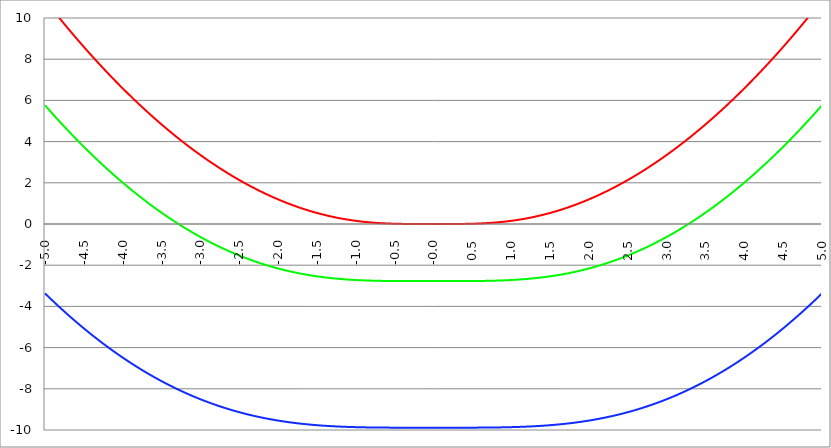
| Category | Series 1 | Series 0 | Series 2 |
|---|---|---|---|
| -5.0 | 10.871 | 5.765 | -3.369 |
| -4.995 | 10.847 | 5.744 | -3.387 |
| -4.99 | 10.823 | 5.722 | -3.405 |
| -4.985 | 10.799 | 5.701 | -3.424 |
| -4.98 | 10.775 | 5.679 | -3.442 |
| -4.975 | 10.751 | 5.658 | -3.46 |
| -4.97 | 10.727 | 5.637 | -3.478 |
| -4.965000000000001 | 10.703 | 5.615 | -3.497 |
| -4.960000000000001 | 10.679 | 5.594 | -3.515 |
| -4.955000000000001 | 10.656 | 5.573 | -3.533 |
| -4.950000000000001 | 10.632 | 5.551 | -3.551 |
| -4.945000000000001 | 10.608 | 5.53 | -3.569 |
| -4.940000000000001 | 10.584 | 5.509 | -3.587 |
| -4.935000000000001 | 10.561 | 5.488 | -3.605 |
| -4.930000000000001 | 10.537 | 5.466 | -3.623 |
| -4.925000000000002 | 10.513 | 5.445 | -3.641 |
| -4.920000000000002 | 10.49 | 5.424 | -3.659 |
| -4.915000000000002 | 10.466 | 5.403 | -3.677 |
| -4.910000000000002 | 10.442 | 5.382 | -3.695 |
| -4.905000000000002 | 10.419 | 5.361 | -3.713 |
| -4.900000000000002 | 10.395 | 5.34 | -3.731 |
| -4.895000000000002 | 10.372 | 5.319 | -3.748 |
| -4.890000000000002 | 10.348 | 5.298 | -3.766 |
| -4.885000000000002 | 10.325 | 5.277 | -3.784 |
| -4.880000000000002 | 10.301 | 5.256 | -3.802 |
| -4.875000000000003 | 10.278 | 5.235 | -3.819 |
| -4.870000000000003 | 10.255 | 5.214 | -3.837 |
| -4.865000000000003 | 10.231 | 5.194 | -3.855 |
| -4.860000000000003 | 10.208 | 5.173 | -3.872 |
| -4.855000000000003 | 10.185 | 5.152 | -3.89 |
| -4.850000000000003 | 10.161 | 5.131 | -3.907 |
| -4.845000000000003 | 10.138 | 5.111 | -3.925 |
| -4.840000000000003 | 10.115 | 5.09 | -3.942 |
| -4.835000000000003 | 10.092 | 5.069 | -3.96 |
| -4.830000000000004 | 10.069 | 5.049 | -3.977 |
| -4.825000000000004 | 10.045 | 5.028 | -3.995 |
| -4.820000000000004 | 10.022 | 5.007 | -4.012 |
| -4.815000000000004 | 9.999 | 4.987 | -4.03 |
| -4.810000000000004 | 9.976 | 4.966 | -4.047 |
| -4.805000000000004 | 9.953 | 4.946 | -4.064 |
| -4.800000000000004 | 9.93 | 4.925 | -4.081 |
| -4.795000000000004 | 9.907 | 4.905 | -4.099 |
| -4.790000000000004 | 9.884 | 4.885 | -4.116 |
| -4.785000000000004 | 9.861 | 4.864 | -4.133 |
| -4.780000000000004 | 9.838 | 4.844 | -4.15 |
| -4.775000000000004 | 9.815 | 4.823 | -4.167 |
| -4.770000000000004 | 9.793 | 4.803 | -4.184 |
| -4.765000000000005 | 9.77 | 4.783 | -4.202 |
| -4.760000000000005 | 9.747 | 4.763 | -4.219 |
| -4.755000000000005 | 9.724 | 4.742 | -4.236 |
| -4.750000000000005 | 9.701 | 4.722 | -4.253 |
| -4.745000000000005 | 9.679 | 4.702 | -4.27 |
| -4.740000000000005 | 9.656 | 4.682 | -4.287 |
| -4.735000000000005 | 9.633 | 4.662 | -4.303 |
| -4.730000000000005 | 9.611 | 4.642 | -4.32 |
| -4.725000000000006 | 9.588 | 4.622 | -4.337 |
| -4.720000000000006 | 9.565 | 4.602 | -4.354 |
| -4.715000000000006 | 9.543 | 4.582 | -4.371 |
| -4.710000000000006 | 9.52 | 4.562 | -4.388 |
| -4.705000000000006 | 9.498 | 4.542 | -4.404 |
| -4.700000000000006 | 9.475 | 4.522 | -4.421 |
| -4.695000000000006 | 9.453 | 4.502 | -4.438 |
| -4.690000000000006 | 9.43 | 4.482 | -4.454 |
| -4.685000000000007 | 9.408 | 4.462 | -4.471 |
| -4.680000000000007 | 9.386 | 4.443 | -4.488 |
| -4.675000000000007 | 9.363 | 4.423 | -4.504 |
| -4.670000000000007 | 9.341 | 4.403 | -4.521 |
| -4.665000000000007 | 9.319 | 4.383 | -4.537 |
| -4.660000000000007 | 9.296 | 4.364 | -4.554 |
| -4.655000000000007 | 9.274 | 4.344 | -4.57 |
| -4.650000000000007 | 9.252 | 4.324 | -4.587 |
| -4.645000000000007 | 9.23 | 4.305 | -4.603 |
| -4.640000000000008 | 9.207 | 4.285 | -4.619 |
| -4.635000000000008 | 9.185 | 4.266 | -4.636 |
| -4.630000000000008 | 9.163 | 4.246 | -4.652 |
| -4.625000000000008 | 9.141 | 4.227 | -4.668 |
| -4.620000000000008 | 9.119 | 4.207 | -4.685 |
| -4.615000000000008 | 9.097 | 4.188 | -4.701 |
| -4.610000000000008 | 9.075 | 4.168 | -4.717 |
| -4.605000000000008 | 9.053 | 4.149 | -4.733 |
| -4.600000000000008 | 9.031 | 4.129 | -4.749 |
| -4.595000000000009 | 9.009 | 4.11 | -4.765 |
| -4.590000000000009 | 8.987 | 4.091 | -4.782 |
| -4.585000000000009 | 8.965 | 4.072 | -4.798 |
| -4.580000000000009 | 8.943 | 4.052 | -4.814 |
| -4.57500000000001 | 8.921 | 4.033 | -4.83 |
| -4.57000000000001 | 8.9 | 4.014 | -4.846 |
| -4.565000000000009 | 8.878 | 3.995 | -4.862 |
| -4.560000000000009 | 8.856 | 3.976 | -4.878 |
| -4.555000000000009 | 8.834 | 3.957 | -4.893 |
| -4.55000000000001 | 8.813 | 3.937 | -4.909 |
| -4.54500000000001 | 8.791 | 3.918 | -4.925 |
| -4.54000000000001 | 8.769 | 3.899 | -4.941 |
| -4.53500000000001 | 8.748 | 3.88 | -4.957 |
| -4.53000000000001 | 8.726 | 3.861 | -4.972 |
| -4.52500000000001 | 8.704 | 3.842 | -4.988 |
| -4.52000000000001 | 8.683 | 3.824 | -5.004 |
| -4.51500000000001 | 8.661 | 3.805 | -5.02 |
| -4.51000000000001 | 8.64 | 3.786 | -5.035 |
| -4.505000000000011 | 8.618 | 3.767 | -5.051 |
| -4.500000000000011 | 8.597 | 3.748 | -5.066 |
| -4.495000000000011 | 8.575 | 3.729 | -5.082 |
| -4.490000000000011 | 8.554 | 3.711 | -5.098 |
| -4.485000000000011 | 8.533 | 3.692 | -5.113 |
| -4.480000000000011 | 8.511 | 3.673 | -5.129 |
| -4.475000000000011 | 8.49 | 3.655 | -5.144 |
| -4.470000000000011 | 8.469 | 3.636 | -5.159 |
| -4.465000000000011 | 8.447 | 3.617 | -5.175 |
| -4.460000000000011 | 8.426 | 3.599 | -5.19 |
| -4.455000000000012 | 8.405 | 3.58 | -5.206 |
| -4.450000000000012 | 8.384 | 3.562 | -5.221 |
| -4.445000000000012 | 8.363 | 3.543 | -5.236 |
| -4.440000000000012 | 8.341 | 3.525 | -5.251 |
| -4.435000000000012 | 8.32 | 3.506 | -5.267 |
| -4.430000000000012 | 8.299 | 3.488 | -5.282 |
| -4.425000000000012 | 8.278 | 3.469 | -5.297 |
| -4.420000000000012 | 8.257 | 3.451 | -5.312 |
| -4.415000000000012 | 8.236 | 3.433 | -5.327 |
| -4.410000000000013 | 8.215 | 3.414 | -5.342 |
| -4.405000000000013 | 8.194 | 3.396 | -5.357 |
| -4.400000000000013 | 8.173 | 3.378 | -5.372 |
| -4.395000000000013 | 8.152 | 3.36 | -5.387 |
| -4.390000000000013 | 8.131 | 3.342 | -5.402 |
| -4.385000000000013 | 8.111 | 3.323 | -5.417 |
| -4.380000000000013 | 8.09 | 3.305 | -5.432 |
| -4.375000000000013 | 8.069 | 3.287 | -5.447 |
| -4.370000000000013 | 8.048 | 3.269 | -5.462 |
| -4.365000000000013 | 8.027 | 3.251 | -5.477 |
| -4.360000000000014 | 8.007 | 3.233 | -5.492 |
| -4.355000000000014 | 7.986 | 3.215 | -5.506 |
| -4.350000000000014 | 7.965 | 3.197 | -5.521 |
| -4.345000000000014 | 7.945 | 3.179 | -5.536 |
| -4.340000000000014 | 7.924 | 3.161 | -5.551 |
| -4.335000000000014 | 7.903 | 3.143 | -5.565 |
| -4.330000000000014 | 7.883 | 3.125 | -5.58 |
| -4.325000000000014 | 7.862 | 3.108 | -5.595 |
| -4.320000000000014 | 7.842 | 3.09 | -5.609 |
| -4.315000000000015 | 7.821 | 3.072 | -5.624 |
| -4.310000000000015 | 7.801 | 3.054 | -5.638 |
| -4.305000000000015 | 7.78 | 3.037 | -5.653 |
| -4.300000000000015 | 7.76 | 3.019 | -5.667 |
| -4.295000000000015 | 7.74 | 3.001 | -5.682 |
| -4.290000000000015 | 7.719 | 2.984 | -5.696 |
| -4.285000000000015 | 7.699 | 2.966 | -5.71 |
| -4.280000000000015 | 7.679 | 2.948 | -5.725 |
| -4.275000000000015 | 7.658 | 2.931 | -5.739 |
| -4.270000000000015 | 7.638 | 2.913 | -5.753 |
| -4.265000000000016 | 7.618 | 2.896 | -5.768 |
| -4.260000000000016 | 7.598 | 2.878 | -5.782 |
| -4.255000000000016 | 7.578 | 2.861 | -5.796 |
| -4.250000000000016 | 7.557 | 2.843 | -5.81 |
| -4.245000000000016 | 7.537 | 2.826 | -5.825 |
| -4.240000000000016 | 7.517 | 2.809 | -5.839 |
| -4.235000000000016 | 7.497 | 2.791 | -5.853 |
| -4.230000000000016 | 7.477 | 2.774 | -5.867 |
| -4.225000000000017 | 7.457 | 2.757 | -5.881 |
| -4.220000000000017 | 7.437 | 2.74 | -5.895 |
| -4.215000000000017 | 7.417 | 2.722 | -5.909 |
| -4.210000000000017 | 7.397 | 2.705 | -5.923 |
| -4.205000000000017 | 7.377 | 2.688 | -5.937 |
| -4.200000000000017 | 7.357 | 2.671 | -5.951 |
| -4.195000000000017 | 7.337 | 2.654 | -5.965 |
| -4.190000000000017 | 7.318 | 2.637 | -5.979 |
| -4.185000000000017 | 7.298 | 2.62 | -5.992 |
| -4.180000000000017 | 7.278 | 2.603 | -6.006 |
| -4.175000000000018 | 7.258 | 2.586 | -6.02 |
| -4.170000000000018 | 7.239 | 2.569 | -6.034 |
| -4.165000000000018 | 7.219 | 2.552 | -6.048 |
| -4.160000000000018 | 7.199 | 2.535 | -6.061 |
| -4.155000000000018 | 7.18 | 2.518 | -6.075 |
| -4.150000000000018 | 7.16 | 2.501 | -6.089 |
| -4.145000000000018 | 7.14 | 2.484 | -6.102 |
| -4.140000000000018 | 7.121 | 2.468 | -6.116 |
| -4.135000000000018 | 7.101 | 2.451 | -6.129 |
| -4.130000000000019 | 7.082 | 2.434 | -6.143 |
| -4.125000000000019 | 7.062 | 2.417 | -6.156 |
| -4.120000000000019 | 7.043 | 2.401 | -6.17 |
| -4.115000000000019 | 7.023 | 2.384 | -6.183 |
| -4.110000000000019 | 7.004 | 2.367 | -6.197 |
| -4.105000000000019 | 6.984 | 2.351 | -6.21 |
| -4.100000000000019 | 6.965 | 2.334 | -6.223 |
| -4.095000000000019 | 6.946 | 2.318 | -6.237 |
| -4.090000000000019 | 6.926 | 2.301 | -6.25 |
| -4.085000000000019 | 6.907 | 2.285 | -6.263 |
| -4.08000000000002 | 6.888 | 2.268 | -6.277 |
| -4.07500000000002 | 6.869 | 2.252 | -6.29 |
| -4.07000000000002 | 6.849 | 2.235 | -6.303 |
| -4.06500000000002 | 6.83 | 2.219 | -6.316 |
| -4.06000000000002 | 6.811 | 2.203 | -6.329 |
| -4.05500000000002 | 6.792 | 2.186 | -6.342 |
| -4.05000000000002 | 6.773 | 2.17 | -6.356 |
| -4.04500000000002 | 6.754 | 2.154 | -6.369 |
| -4.04000000000002 | 6.735 | 2.137 | -6.382 |
| -4.03500000000002 | 6.716 | 2.121 | -6.395 |
| -4.03000000000002 | 6.697 | 2.105 | -6.408 |
| -4.025000000000021 | 6.678 | 2.089 | -6.421 |
| -4.020000000000021 | 6.659 | 2.073 | -6.434 |
| -4.015000000000021 | 6.64 | 2.057 | -6.446 |
| -4.010000000000021 | 6.621 | 2.041 | -6.459 |
| -4.005000000000021 | 6.602 | 2.025 | -6.472 |
| -4.000000000000021 | 6.583 | 2.009 | -6.485 |
| -3.995000000000021 | 6.565 | 1.993 | -6.498 |
| -3.990000000000021 | 6.546 | 1.977 | -6.51 |
| -3.985000000000022 | 6.527 | 1.961 | -6.523 |
| -3.980000000000022 | 6.508 | 1.945 | -6.536 |
| -3.975000000000022 | 6.49 | 1.929 | -6.549 |
| -3.970000000000022 | 6.471 | 1.913 | -6.561 |
| -3.965000000000022 | 6.452 | 1.897 | -6.574 |
| -3.960000000000022 | 6.434 | 1.881 | -6.586 |
| -3.955000000000022 | 6.415 | 1.866 | -6.599 |
| -3.950000000000022 | 6.396 | 1.85 | -6.612 |
| -3.945000000000022 | 6.378 | 1.834 | -6.624 |
| -3.940000000000023 | 6.359 | 1.819 | -6.637 |
| -3.935000000000023 | 6.341 | 1.803 | -6.649 |
| -3.930000000000023 | 6.322 | 1.787 | -6.661 |
| -3.925000000000023 | 6.304 | 1.772 | -6.674 |
| -3.920000000000023 | 6.286 | 1.756 | -6.686 |
| -3.915000000000023 | 6.267 | 1.741 | -6.699 |
| -3.910000000000023 | 6.249 | 1.725 | -6.711 |
| -3.905000000000023 | 6.23 | 1.71 | -6.723 |
| -3.900000000000023 | 6.212 | 1.694 | -6.735 |
| -3.895000000000023 | 6.194 | 1.679 | -6.748 |
| -3.890000000000024 | 6.176 | 1.663 | -6.76 |
| -3.885000000000024 | 6.157 | 1.648 | -6.772 |
| -3.880000000000024 | 6.139 | 1.633 | -6.784 |
| -3.875000000000024 | 6.121 | 1.617 | -6.796 |
| -3.870000000000024 | 6.103 | 1.602 | -6.808 |
| -3.865000000000024 | 6.085 | 1.587 | -6.821 |
| -3.860000000000024 | 6.067 | 1.572 | -6.833 |
| -3.855000000000024 | 6.049 | 1.556 | -6.845 |
| -3.850000000000024 | 6.031 | 1.541 | -6.857 |
| -3.845000000000025 | 6.013 | 1.526 | -6.869 |
| -3.840000000000025 | 5.995 | 1.511 | -6.88 |
| -3.835000000000025 | 5.977 | 1.496 | -6.892 |
| -3.830000000000025 | 5.959 | 1.481 | -6.904 |
| -3.825000000000025 | 5.941 | 1.466 | -6.916 |
| -3.820000000000025 | 5.923 | 1.451 | -6.928 |
| -3.815000000000025 | 5.905 | 1.436 | -6.94 |
| -3.810000000000025 | 5.887 | 1.421 | -6.952 |
| -3.805000000000025 | 5.869 | 1.406 | -6.963 |
| -3.800000000000026 | 5.852 | 1.391 | -6.975 |
| -3.795000000000026 | 5.834 | 1.376 | -6.987 |
| -3.790000000000026 | 5.816 | 1.361 | -6.998 |
| -3.785000000000026 | 5.798 | 1.346 | -7.01 |
| -3.780000000000026 | 5.781 | 1.332 | -7.022 |
| -3.775000000000026 | 5.763 | 1.317 | -7.033 |
| -3.770000000000026 | 5.745 | 1.302 | -7.045 |
| -3.765000000000026 | 5.728 | 1.287 | -7.056 |
| -3.760000000000026 | 5.71 | 1.273 | -7.068 |
| -3.755000000000026 | 5.693 | 1.258 | -7.079 |
| -3.750000000000027 | 5.675 | 1.244 | -7.091 |
| -3.745000000000027 | 5.658 | 1.229 | -7.102 |
| -3.740000000000027 | 5.64 | 1.214 | -7.113 |
| -3.735000000000027 | 5.623 | 1.2 | -7.125 |
| -3.730000000000027 | 5.605 | 1.185 | -7.136 |
| -3.725000000000027 | 5.588 | 1.171 | -7.148 |
| -3.720000000000027 | 5.571 | 1.156 | -7.159 |
| -3.715000000000027 | 5.553 | 1.142 | -7.17 |
| -3.710000000000027 | 5.536 | 1.128 | -7.181 |
| -3.705000000000028 | 5.519 | 1.113 | -7.192 |
| -3.700000000000028 | 5.501 | 1.099 | -7.204 |
| -3.695000000000028 | 5.484 | 1.085 | -7.215 |
| -3.690000000000028 | 5.467 | 1.07 | -7.226 |
| -3.685000000000028 | 5.45 | 1.056 | -7.237 |
| -3.680000000000028 | 5.433 | 1.042 | -7.248 |
| -3.675000000000028 | 5.416 | 1.028 | -7.259 |
| -3.670000000000028 | 5.398 | 1.014 | -7.27 |
| -3.665000000000028 | 5.381 | 0.999 | -7.281 |
| -3.660000000000028 | 5.364 | 0.985 | -7.292 |
| -3.655000000000029 | 5.347 | 0.971 | -7.303 |
| -3.650000000000029 | 5.33 | 0.957 | -7.314 |
| -3.645000000000029 | 5.313 | 0.943 | -7.325 |
| -3.640000000000029 | 5.296 | 0.929 | -7.336 |
| -3.635000000000029 | 5.28 | 0.915 | -7.346 |
| -3.630000000000029 | 5.263 | 0.901 | -7.357 |
| -3.625000000000029 | 5.246 | 0.887 | -7.368 |
| -3.620000000000029 | 5.229 | 0.874 | -7.379 |
| -3.615000000000029 | 5.212 | 0.86 | -7.39 |
| -3.61000000000003 | 5.195 | 0.846 | -7.4 |
| -3.60500000000003 | 5.179 | 0.832 | -7.411 |
| -3.60000000000003 | 5.162 | 0.818 | -7.422 |
| -3.59500000000003 | 5.145 | 0.805 | -7.432 |
| -3.59000000000003 | 5.129 | 0.791 | -7.443 |
| -3.58500000000003 | 5.112 | 0.777 | -7.453 |
| -3.58000000000003 | 5.095 | 0.763 | -7.464 |
| -3.57500000000003 | 5.079 | 0.75 | -7.474 |
| -3.57000000000003 | 5.062 | 0.736 | -7.485 |
| -3.565000000000031 | 5.046 | 0.723 | -7.495 |
| -3.560000000000031 | 5.029 | 0.709 | -7.506 |
| -3.555000000000031 | 5.013 | 0.696 | -7.516 |
| -3.550000000000031 | 4.996 | 0.682 | -7.526 |
| -3.545000000000031 | 4.98 | 0.669 | -7.537 |
| -3.540000000000031 | 4.963 | 0.655 | -7.547 |
| -3.535000000000031 | 4.947 | 0.642 | -7.557 |
| -3.530000000000031 | 4.931 | 0.628 | -7.568 |
| -3.525000000000031 | 4.914 | 0.615 | -7.578 |
| -3.520000000000032 | 4.898 | 0.602 | -7.588 |
| -3.515000000000032 | 4.882 | 0.589 | -7.598 |
| -3.510000000000032 | 4.865 | 0.575 | -7.608 |
| -3.505000000000032 | 4.849 | 0.562 | -7.619 |
| -3.500000000000032 | 4.833 | 0.549 | -7.629 |
| -3.495000000000032 | 4.817 | 0.536 | -7.639 |
| -3.490000000000032 | 4.801 | 0.522 | -7.649 |
| -3.485000000000032 | 4.785 | 0.509 | -7.659 |
| -3.480000000000032 | 4.768 | 0.496 | -7.669 |
| -3.475000000000032 | 4.752 | 0.483 | -7.679 |
| -3.470000000000033 | 4.736 | 0.47 | -7.689 |
| -3.465000000000033 | 4.72 | 0.457 | -7.699 |
| -3.460000000000033 | 4.704 | 0.444 | -7.708 |
| -3.455000000000033 | 4.688 | 0.431 | -7.718 |
| -3.450000000000033 | 4.673 | 0.418 | -7.728 |
| -3.445000000000033 | 4.657 | 0.405 | -7.738 |
| -3.440000000000033 | 4.641 | 0.393 | -7.748 |
| -3.435000000000033 | 4.625 | 0.38 | -7.758 |
| -3.430000000000033 | 4.609 | 0.367 | -7.767 |
| -3.425000000000034 | 4.593 | 0.354 | -7.777 |
| -3.420000000000034 | 4.578 | 0.341 | -7.787 |
| -3.415000000000034 | 4.562 | 0.329 | -7.796 |
| -3.410000000000034 | 4.546 | 0.316 | -7.806 |
| -3.405000000000034 | 4.53 | 0.303 | -7.815 |
| -3.400000000000034 | 4.515 | 0.291 | -7.825 |
| -3.395000000000034 | 4.499 | 0.278 | -7.835 |
| -3.390000000000034 | 4.484 | 0.265 | -7.844 |
| -3.385000000000034 | 4.468 | 0.253 | -7.854 |
| -3.380000000000034 | 4.452 | 0.24 | -7.863 |
| -3.375000000000035 | 4.437 | 0.228 | -7.873 |
| -3.370000000000035 | 4.421 | 0.215 | -7.882 |
| -3.365000000000035 | 4.406 | 0.203 | -7.891 |
| -3.360000000000035 | 4.39 | 0.19 | -7.901 |
| -3.355000000000035 | 4.375 | 0.178 | -7.91 |
| -3.350000000000035 | 4.36 | 0.166 | -7.919 |
| -3.345000000000035 | 4.344 | 0.153 | -7.929 |
| -3.340000000000035 | 4.329 | 0.141 | -7.938 |
| -3.335000000000035 | 4.314 | 0.129 | -7.947 |
| -3.330000000000036 | 4.298 | 0.117 | -7.956 |
| -3.325000000000036 | 4.283 | 0.104 | -7.965 |
| -3.320000000000036 | 4.268 | 0.092 | -7.975 |
| -3.315000000000036 | 4.253 | 0.08 | -7.984 |
| -3.310000000000036 | 4.237 | 0.068 | -7.993 |
| -3.305000000000036 | 4.222 | 0.056 | -8.002 |
| -3.300000000000036 | 4.207 | 0.044 | -8.011 |
| -3.295000000000036 | 4.192 | 0.032 | -8.02 |
| -3.290000000000036 | 4.177 | 0.02 | -8.029 |
| -3.285000000000036 | 4.162 | 0.008 | -8.038 |
| -3.280000000000036 | 4.147 | -0.004 | -8.047 |
| -3.275000000000037 | 4.132 | -0.016 | -8.056 |
| -3.270000000000037 | 4.117 | -0.028 | -8.065 |
| -3.265000000000037 | 4.102 | -0.04 | -8.074 |
| -3.260000000000037 | 4.087 | -0.052 | -8.082 |
| -3.255000000000037 | 4.072 | -0.064 | -8.091 |
| -3.250000000000037 | 4.057 | -0.076 | -8.1 |
| -3.245000000000037 | 4.043 | -0.087 | -8.109 |
| -3.240000000000037 | 4.028 | -0.099 | -8.118 |
| -3.235000000000038 | 4.013 | -0.111 | -8.126 |
| -3.230000000000038 | 3.998 | -0.123 | -8.135 |
| -3.225000000000038 | 3.983 | -0.134 | -8.144 |
| -3.220000000000038 | 3.969 | -0.146 | -8.152 |
| -3.215000000000038 | 3.954 | -0.157 | -8.161 |
| -3.210000000000038 | 3.939 | -0.169 | -8.169 |
| -3.205000000000038 | 3.925 | -0.181 | -8.178 |
| -3.200000000000038 | 3.91 | -0.192 | -8.186 |
| -3.195000000000038 | 3.896 | -0.204 | -8.195 |
| -3.190000000000039 | 3.881 | -0.215 | -8.203 |
| -3.185000000000039 | 3.867 | -0.227 | -8.212 |
| -3.180000000000039 | 3.852 | -0.238 | -8.22 |
| -3.175000000000039 | 3.838 | -0.249 | -8.229 |
| -3.170000000000039 | 3.823 | -0.261 | -8.237 |
| -3.16500000000004 | 3.809 | -0.272 | -8.245 |
| -3.16000000000004 | 3.795 | -0.283 | -8.254 |
| -3.155000000000039 | 3.78 | -0.295 | -8.262 |
| -3.150000000000039 | 3.766 | -0.306 | -8.27 |
| -3.14500000000004 | 3.752 | -0.317 | -8.279 |
| -3.14000000000004 | 3.737 | -0.328 | -8.287 |
| -3.13500000000004 | 3.723 | -0.339 | -8.295 |
| -3.13000000000004 | 3.709 | -0.35 | -8.303 |
| -3.12500000000004 | 3.695 | -0.362 | -8.311 |
| -3.12000000000004 | 3.68 | -0.373 | -8.319 |
| -3.11500000000004 | 3.666 | -0.384 | -8.328 |
| -3.11000000000004 | 3.652 | -0.395 | -8.336 |
| -3.10500000000004 | 3.638 | -0.406 | -8.344 |
| -3.10000000000004 | 3.624 | -0.417 | -8.352 |
| -3.095000000000041 | 3.61 | -0.428 | -8.36 |
| -3.090000000000041 | 3.596 | -0.438 | -8.368 |
| -3.085000000000041 | 3.582 | -0.449 | -8.376 |
| -3.080000000000041 | 3.568 | -0.46 | -8.383 |
| -3.075000000000041 | 3.554 | -0.471 | -8.391 |
| -3.070000000000041 | 3.54 | -0.482 | -8.399 |
| -3.065000000000041 | 3.526 | -0.493 | -8.407 |
| -3.060000000000041 | 3.513 | -0.503 | -8.415 |
| -3.055000000000041 | 3.499 | -0.514 | -8.423 |
| -3.050000000000042 | 3.485 | -0.525 | -8.43 |
| -3.045000000000042 | 3.471 | -0.535 | -8.438 |
| -3.040000000000042 | 3.458 | -0.546 | -8.446 |
| -3.035000000000042 | 3.444 | -0.557 | -8.454 |
| -3.030000000000042 | 3.43 | -0.567 | -8.461 |
| -3.025000000000042 | 3.417 | -0.578 | -8.469 |
| -3.020000000000042 | 3.403 | -0.588 | -8.476 |
| -3.015000000000042 | 3.389 | -0.599 | -8.484 |
| -3.010000000000042 | 3.376 | -0.609 | -8.492 |
| -3.005000000000043 | 3.362 | -0.62 | -8.499 |
| -3.000000000000043 | 3.349 | -0.63 | -8.507 |
| -2.995000000000043 | 3.335 | -0.64 | -8.514 |
| -2.990000000000043 | 3.322 | -0.651 | -8.522 |
| -2.985000000000043 | 3.308 | -0.661 | -8.529 |
| -2.980000000000043 | 3.295 | -0.671 | -8.536 |
| -2.975000000000043 | 3.282 | -0.681 | -8.544 |
| -2.970000000000043 | 3.268 | -0.692 | -8.551 |
| -2.965000000000043 | 3.255 | -0.702 | -8.559 |
| -2.960000000000043 | 3.242 | -0.712 | -8.566 |
| -2.955000000000044 | 3.228 | -0.722 | -8.573 |
| -2.950000000000044 | 3.215 | -0.732 | -8.58 |
| -2.945000000000044 | 3.202 | -0.742 | -8.588 |
| -2.940000000000044 | 3.189 | -0.753 | -8.595 |
| -2.935000000000044 | 3.175 | -0.763 | -8.602 |
| -2.930000000000044 | 3.162 | -0.773 | -8.609 |
| -2.925000000000044 | 3.149 | -0.783 | -8.616 |
| -2.920000000000044 | 3.136 | -0.792 | -8.623 |
| -2.915000000000044 | 3.123 | -0.802 | -8.631 |
| -2.910000000000045 | 3.11 | -0.812 | -8.638 |
| -2.905000000000045 | 3.097 | -0.822 | -8.645 |
| -2.900000000000045 | 3.084 | -0.832 | -8.652 |
| -2.895000000000045 | 3.071 | -0.842 | -8.659 |
| -2.890000000000045 | 3.058 | -0.852 | -8.666 |
| -2.885000000000045 | 3.045 | -0.861 | -8.673 |
| -2.880000000000045 | 3.032 | -0.871 | -8.68 |
| -2.875000000000045 | 3.02 | -0.881 | -8.686 |
| -2.870000000000045 | 3.007 | -0.89 | -8.693 |
| -2.865000000000045 | 2.994 | -0.9 | -8.7 |
| -2.860000000000046 | 2.981 | -0.91 | -8.707 |
| -2.855000000000046 | 2.969 | -0.919 | -8.714 |
| -2.850000000000046 | 2.956 | -0.929 | -8.721 |
| -2.845000000000046 | 2.943 | -0.938 | -8.727 |
| -2.840000000000046 | 2.931 | -0.948 | -8.734 |
| -2.835000000000046 | 2.918 | -0.957 | -8.741 |
| -2.830000000000046 | 2.905 | -0.967 | -8.747 |
| -2.825000000000046 | 2.893 | -0.976 | -8.754 |
| -2.820000000000046 | 2.88 | -0.986 | -8.761 |
| -2.815000000000047 | 2.868 | -0.995 | -8.767 |
| -2.810000000000047 | 2.855 | -1.004 | -8.774 |
| -2.805000000000047 | 2.843 | -1.014 | -8.78 |
| -2.800000000000047 | 2.83 | -1.023 | -8.787 |
| -2.795000000000047 | 2.818 | -1.032 | -8.793 |
| -2.790000000000047 | 2.806 | -1.041 | -8.8 |
| -2.785000000000047 | 2.793 | -1.051 | -8.806 |
| -2.780000000000047 | 2.781 | -1.06 | -8.813 |
| -2.775000000000047 | 2.769 | -1.069 | -8.819 |
| -2.770000000000047 | 2.756 | -1.078 | -8.826 |
| -2.765000000000048 | 2.744 | -1.087 | -8.832 |
| -2.760000000000048 | 2.732 | -1.096 | -8.838 |
| -2.755000000000048 | 2.72 | -1.105 | -8.845 |
| -2.750000000000048 | 2.708 | -1.114 | -8.851 |
| -2.745000000000048 | 2.695 | -1.123 | -8.857 |
| -2.740000000000048 | 2.683 | -1.132 | -8.863 |
| -2.735000000000048 | 2.671 | -1.141 | -8.87 |
| -2.730000000000048 | 2.659 | -1.15 | -8.876 |
| -2.725000000000048 | 2.647 | -1.159 | -8.882 |
| -2.720000000000049 | 2.635 | -1.168 | -8.888 |
| -2.715000000000049 | 2.623 | -1.177 | -8.894 |
| -2.710000000000049 | 2.611 | -1.185 | -8.9 |
| -2.705000000000049 | 2.599 | -1.194 | -8.906 |
| -2.700000000000049 | 2.587 | -1.203 | -8.912 |
| -2.695000000000049 | 2.576 | -1.212 | -8.919 |
| -2.690000000000049 | 2.564 | -1.22 | -8.925 |
| -2.685000000000049 | 2.552 | -1.229 | -8.93 |
| -2.680000000000049 | 2.54 | -1.237 | -8.936 |
| -2.675000000000049 | 2.528 | -1.246 | -8.942 |
| -2.67000000000005 | 2.517 | -1.255 | -8.948 |
| -2.66500000000005 | 2.505 | -1.263 | -8.954 |
| -2.66000000000005 | 2.493 | -1.272 | -8.96 |
| -2.65500000000005 | 2.482 | -1.28 | -8.966 |
| -2.65000000000005 | 2.47 | -1.289 | -8.972 |
| -2.64500000000005 | 2.459 | -1.297 | -8.978 |
| -2.64000000000005 | 2.447 | -1.305 | -8.983 |
| -2.63500000000005 | 2.435 | -1.314 | -8.989 |
| -2.63000000000005 | 2.424 | -1.322 | -8.995 |
| -2.625000000000051 | 2.412 | -1.33 | -9 |
| -2.620000000000051 | 2.401 | -1.339 | -9.006 |
| -2.615000000000051 | 2.39 | -1.347 | -9.012 |
| -2.610000000000051 | 2.378 | -1.355 | -9.017 |
| -2.605000000000051 | 2.367 | -1.363 | -9.023 |
| -2.600000000000051 | 2.356 | -1.372 | -9.029 |
| -2.595000000000051 | 2.344 | -1.38 | -9.034 |
| -2.590000000000051 | 2.333 | -1.388 | -9.04 |
| -2.585000000000051 | 2.322 | -1.396 | -9.045 |
| -2.580000000000052 | 2.31 | -1.404 | -9.051 |
| -2.575000000000052 | 2.299 | -1.412 | -9.056 |
| -2.570000000000052 | 2.288 | -1.42 | -9.062 |
| -2.565000000000052 | 2.277 | -1.428 | -9.067 |
| -2.560000000000052 | 2.266 | -1.436 | -9.073 |
| -2.555000000000052 | 2.255 | -1.444 | -9.078 |
| -2.550000000000052 | 2.244 | -1.452 | -9.083 |
| -2.545000000000052 | 2.233 | -1.46 | -9.089 |
| -2.540000000000052 | 2.222 | -1.468 | -9.094 |
| -2.535000000000053 | 2.211 | -1.476 | -9.099 |
| -2.530000000000053 | 2.2 | -1.483 | -9.104 |
| -2.525000000000053 | 2.189 | -1.491 | -9.11 |
| -2.520000000000053 | 2.178 | -1.499 | -9.115 |
| -2.515000000000053 | 2.167 | -1.507 | -9.12 |
| -2.510000000000053 | 2.156 | -1.514 | -9.125 |
| -2.505000000000053 | 2.145 | -1.522 | -9.13 |
| -2.500000000000053 | 2.134 | -1.53 | -9.136 |
| -2.495000000000053 | 2.124 | -1.537 | -9.141 |
| -2.490000000000053 | 2.113 | -1.545 | -9.146 |
| -2.485000000000054 | 2.102 | -1.552 | -9.151 |
| -2.480000000000054 | 2.092 | -1.56 | -9.156 |
| -2.475000000000054 | 2.081 | -1.567 | -9.161 |
| -2.470000000000054 | 2.07 | -1.575 | -9.166 |
| -2.465000000000054 | 2.06 | -1.582 | -9.171 |
| -2.460000000000054 | 2.049 | -1.59 | -9.176 |
| -2.455000000000054 | 2.039 | -1.597 | -9.181 |
| -2.450000000000054 | 2.028 | -1.604 | -9.186 |
| -2.445000000000054 | 2.018 | -1.612 | -9.191 |
| -2.440000000000055 | 2.007 | -1.619 | -9.195 |
| -2.435000000000055 | 1.997 | -1.626 | -9.2 |
| -2.430000000000055 | 1.986 | -1.634 | -9.205 |
| -2.425000000000055 | 1.976 | -1.641 | -9.21 |
| -2.420000000000055 | 1.966 | -1.648 | -9.215 |
| -2.415000000000055 | 1.955 | -1.655 | -9.219 |
| -2.410000000000055 | 1.945 | -1.662 | -9.224 |
| -2.405000000000055 | 1.935 | -1.669 | -9.229 |
| -2.400000000000055 | 1.924 | -1.677 | -9.234 |
| -2.395000000000055 | 1.914 | -1.684 | -9.238 |
| -2.390000000000056 | 1.904 | -1.691 | -9.243 |
| -2.385000000000056 | 1.894 | -1.698 | -9.248 |
| -2.380000000000056 | 1.884 | -1.705 | -9.252 |
| -2.375000000000056 | 1.874 | -1.712 | -9.257 |
| -2.370000000000056 | 1.864 | -1.719 | -9.261 |
| -2.365000000000056 | 1.854 | -1.726 | -9.266 |
| -2.360000000000056 | 1.844 | -1.732 | -9.27 |
| -2.355000000000056 | 1.834 | -1.739 | -9.275 |
| -2.350000000000056 | 1.824 | -1.746 | -9.279 |
| -2.345000000000057 | 1.814 | -1.753 | -9.284 |
| -2.340000000000057 | 1.804 | -1.76 | -9.288 |
| -2.335000000000057 | 1.794 | -1.766 | -9.293 |
| -2.330000000000057 | 1.784 | -1.773 | -9.297 |
| -2.325000000000057 | 1.774 | -1.78 | -9.301 |
| -2.320000000000057 | 1.764 | -1.786 | -9.306 |
| -2.315000000000057 | 1.755 | -1.793 | -9.31 |
| -2.310000000000057 | 1.745 | -1.8 | -9.314 |
| -2.305000000000057 | 1.735 | -1.806 | -9.319 |
| -2.300000000000058 | 1.726 | -1.813 | -9.323 |
| -2.295000000000058 | 1.716 | -1.819 | -9.327 |
| -2.290000000000058 | 1.706 | -1.826 | -9.331 |
| -2.285000000000058 | 1.697 | -1.832 | -9.336 |
| -2.280000000000058 | 1.687 | -1.839 | -9.34 |
| -2.275000000000058 | 1.678 | -1.845 | -9.344 |
| -2.270000000000058 | 1.668 | -1.852 | -9.348 |
| -2.265000000000058 | 1.658 | -1.858 | -9.352 |
| -2.260000000000058 | 1.649 | -1.864 | -9.356 |
| -2.255000000000058 | 1.64 | -1.871 | -9.36 |
| -2.250000000000059 | 1.63 | -1.877 | -9.365 |
| -2.245000000000059 | 1.621 | -1.883 | -9.369 |
| -2.240000000000059 | 1.611 | -1.89 | -9.373 |
| -2.235000000000059 | 1.602 | -1.896 | -9.377 |
| -2.23000000000006 | 1.593 | -1.902 | -9.381 |
| -2.22500000000006 | 1.584 | -1.908 | -9.385 |
| -2.22000000000006 | 1.574 | -1.914 | -9.388 |
| -2.215000000000059 | 1.565 | -1.92 | -9.392 |
| -2.210000000000059 | 1.556 | -1.926 | -9.396 |
| -2.20500000000006 | 1.547 | -1.933 | -9.4 |
| -2.20000000000006 | 1.538 | -1.939 | -9.404 |
| -2.19500000000006 | 1.529 | -1.945 | -9.408 |
| -2.19000000000006 | 1.519 | -1.951 | -9.412 |
| -2.18500000000006 | 1.51 | -1.957 | -9.415 |
| -2.18000000000006 | 1.501 | -1.962 | -9.419 |
| -2.17500000000006 | 1.492 | -1.968 | -9.423 |
| -2.17000000000006 | 1.483 | -1.974 | -9.427 |
| -2.16500000000006 | 1.475 | -1.98 | -9.43 |
| -2.160000000000061 | 1.466 | -1.986 | -9.434 |
| -2.155000000000061 | 1.457 | -1.992 | -9.438 |
| -2.150000000000061 | 1.448 | -1.998 | -9.442 |
| -2.145000000000061 | 1.439 | -2.003 | -9.445 |
| -2.140000000000061 | 1.43 | -2.009 | -9.449 |
| -2.135000000000061 | 1.421 | -2.015 | -9.452 |
| -2.130000000000061 | 1.413 | -2.02 | -9.456 |
| -2.125000000000061 | 1.404 | -2.026 | -9.459 |
| -2.120000000000061 | 1.395 | -2.032 | -9.463 |
| -2.115000000000061 | 1.387 | -2.037 | -9.467 |
| -2.110000000000062 | 1.378 | -2.043 | -9.47 |
| -2.105000000000062 | 1.369 | -2.048 | -9.474 |
| -2.100000000000062 | 1.361 | -2.054 | -9.477 |
| -2.095000000000062 | 1.352 | -2.059 | -9.48 |
| -2.090000000000062 | 1.344 | -2.065 | -9.484 |
| -2.085000000000062 | 1.335 | -2.07 | -9.487 |
| -2.080000000000062 | 1.327 | -2.076 | -9.491 |
| -2.075000000000062 | 1.318 | -2.081 | -9.494 |
| -2.070000000000062 | 1.31 | -2.086 | -9.497 |
| -2.065000000000063 | 1.302 | -2.092 | -9.501 |
| -2.060000000000063 | 1.293 | -2.097 | -9.504 |
| -2.055000000000063 | 1.285 | -2.102 | -9.507 |
| -2.050000000000063 | 1.277 | -2.108 | -9.511 |
| -2.045000000000063 | 1.268 | -2.113 | -9.514 |
| -2.040000000000063 | 1.26 | -2.118 | -9.517 |
| -2.035000000000063 | 1.252 | -2.123 | -9.52 |
| -2.030000000000063 | 1.244 | -2.128 | -9.523 |
| -2.025000000000063 | 1.236 | -2.134 | -9.527 |
| -2.020000000000064 | 1.228 | -2.139 | -9.53 |
| -2.015000000000064 | 1.219 | -2.144 | -9.533 |
| -2.010000000000064 | 1.211 | -2.149 | -9.536 |
| -2.005000000000064 | 1.203 | -2.154 | -9.539 |
| -2.000000000000064 | 1.195 | -2.159 | -9.542 |
| -1.995000000000064 | 1.187 | -2.164 | -9.545 |
| -1.990000000000064 | 1.179 | -2.169 | -9.548 |
| -1.985000000000064 | 1.171 | -2.174 | -9.551 |
| -1.980000000000064 | 1.164 | -2.179 | -9.554 |
| -1.975000000000064 | 1.156 | -2.184 | -9.557 |
| -1.970000000000065 | 1.148 | -2.188 | -9.56 |
| -1.965000000000065 | 1.14 | -2.193 | -9.563 |
| -1.960000000000065 | 1.132 | -2.198 | -9.566 |
| -1.955000000000065 | 1.124 | -2.203 | -9.569 |
| -1.950000000000065 | 1.117 | -2.208 | -9.572 |
| -1.945000000000065 | 1.109 | -2.212 | -9.575 |
| -1.940000000000065 | 1.101 | -2.217 | -9.578 |
| -1.935000000000065 | 1.094 | -2.222 | -9.581 |
| -1.930000000000065 | 1.086 | -2.226 | -9.584 |
| -1.925000000000066 | 1.078 | -2.231 | -9.586 |
| -1.920000000000066 | 1.071 | -2.236 | -9.589 |
| -1.915000000000066 | 1.063 | -2.24 | -9.592 |
| -1.910000000000066 | 1.056 | -2.245 | -9.595 |
| -1.905000000000066 | 1.048 | -2.249 | -9.597 |
| -1.900000000000066 | 1.041 | -2.254 | -9.6 |
| -1.895000000000066 | 1.033 | -2.258 | -9.603 |
| -1.890000000000066 | 1.026 | -2.263 | -9.606 |
| -1.885000000000066 | 1.019 | -2.267 | -9.608 |
| -1.880000000000066 | 1.011 | -2.272 | -9.611 |
| -1.875000000000067 | 1.004 | -2.276 | -9.614 |
| -1.870000000000067 | 0.997 | -2.281 | -9.616 |
| -1.865000000000067 | 0.989 | -2.285 | -9.619 |
| -1.860000000000067 | 0.982 | -2.289 | -9.621 |
| -1.855000000000067 | 0.975 | -2.294 | -9.624 |
| -1.850000000000067 | 0.968 | -2.298 | -9.627 |
| -1.845000000000067 | 0.961 | -2.302 | -9.629 |
| -1.840000000000067 | 0.954 | -2.306 | -9.632 |
| -1.835000000000067 | 0.947 | -2.31 | -9.634 |
| -1.830000000000068 | 0.939 | -2.315 | -9.637 |
| -1.825000000000068 | 0.932 | -2.319 | -9.639 |
| -1.820000000000068 | 0.925 | -2.323 | -9.642 |
| -1.815000000000068 | 0.918 | -2.327 | -9.644 |
| -1.810000000000068 | 0.912 | -2.331 | -9.646 |
| -1.805000000000068 | 0.905 | -2.335 | -9.649 |
| -1.800000000000068 | 0.898 | -2.339 | -9.651 |
| -1.795000000000068 | 0.891 | -2.343 | -9.654 |
| -1.790000000000068 | 0.884 | -2.347 | -9.656 |
| -1.785000000000068 | 0.877 | -2.351 | -9.658 |
| -1.780000000000069 | 0.87 | -2.355 | -9.661 |
| -1.775000000000069 | 0.864 | -2.359 | -9.663 |
| -1.770000000000069 | 0.857 | -2.363 | -9.665 |
| -1.765000000000069 | 0.85 | -2.367 | -9.667 |
| -1.760000000000069 | 0.844 | -2.371 | -9.67 |
| -1.75500000000007 | 0.837 | -2.375 | -9.672 |
| -1.75000000000007 | 0.83 | -2.378 | -9.674 |
| -1.745000000000069 | 0.824 | -2.382 | -9.676 |
| -1.740000000000069 | 0.817 | -2.386 | -9.679 |
| -1.73500000000007 | 0.811 | -2.39 | -9.681 |
| -1.73000000000007 | 0.804 | -2.393 | -9.683 |
| -1.72500000000007 | 0.798 | -2.397 | -9.685 |
| -1.72000000000007 | 0.791 | -2.401 | -9.687 |
| -1.71500000000007 | 0.785 | -2.404 | -9.689 |
| -1.71000000000007 | 0.778 | -2.408 | -9.691 |
| -1.70500000000007 | 0.772 | -2.412 | -9.694 |
| -1.70000000000007 | 0.766 | -2.415 | -9.696 |
| -1.69500000000007 | 0.759 | -2.419 | -9.698 |
| -1.69000000000007 | 0.753 | -2.422 | -9.7 |
| -1.685000000000071 | 0.747 | -2.426 | -9.702 |
| -1.680000000000071 | 0.741 | -2.429 | -9.704 |
| -1.675000000000071 | 0.735 | -2.433 | -9.706 |
| -1.670000000000071 | 0.728 | -2.436 | -9.708 |
| -1.665000000000071 | 0.722 | -2.44 | -9.71 |
| -1.660000000000071 | 0.716 | -2.443 | -9.712 |
| -1.655000000000071 | 0.71 | -2.446 | -9.714 |
| -1.650000000000071 | 0.704 | -2.45 | -9.716 |
| -1.645000000000071 | 0.698 | -2.453 | -9.717 |
| -1.640000000000072 | 0.692 | -2.456 | -9.719 |
| -1.635000000000072 | 0.686 | -2.46 | -9.721 |
| -1.630000000000072 | 0.68 | -2.463 | -9.723 |
| -1.625000000000072 | 0.674 | -2.466 | -9.725 |
| -1.620000000000072 | 0.668 | -2.469 | -9.727 |
| -1.615000000000072 | 0.663 | -2.473 | -9.729 |
| -1.610000000000072 | 0.657 | -2.476 | -9.73 |
| -1.605000000000072 | 0.651 | -2.479 | -9.732 |
| -1.600000000000072 | 0.645 | -2.482 | -9.734 |
| -1.595000000000073 | 0.639 | -2.485 | -9.736 |
| -1.590000000000073 | 0.634 | -2.488 | -9.737 |
| -1.585000000000073 | 0.628 | -2.491 | -9.739 |
| -1.580000000000073 | 0.622 | -2.494 | -9.741 |
| -1.575000000000073 | 0.617 | -2.497 | -9.743 |
| -1.570000000000073 | 0.611 | -2.5 | -9.744 |
| -1.565000000000073 | 0.606 | -2.503 | -9.746 |
| -1.560000000000073 | 0.6 | -2.506 | -9.748 |
| -1.555000000000073 | 0.594 | -2.509 | -9.749 |
| -1.550000000000074 | 0.589 | -2.512 | -9.751 |
| -1.545000000000074 | 0.584 | -2.515 | -9.753 |
| -1.540000000000074 | 0.578 | -2.518 | -9.754 |
| -1.535000000000074 | 0.573 | -2.521 | -9.756 |
| -1.530000000000074 | 0.567 | -2.524 | -9.757 |
| -1.525000000000074 | 0.562 | -2.526 | -9.759 |
| -1.520000000000074 | 0.557 | -2.529 | -9.761 |
| -1.515000000000074 | 0.551 | -2.532 | -9.762 |
| -1.510000000000074 | 0.546 | -2.535 | -9.764 |
| -1.505000000000074 | 0.541 | -2.537 | -9.765 |
| -1.500000000000075 | 0.536 | -2.54 | -9.767 |
| -1.495000000000075 | 0.53 | -2.543 | -9.768 |
| -1.490000000000075 | 0.525 | -2.546 | -9.77 |
| -1.485000000000075 | 0.52 | -2.548 | -9.771 |
| -1.480000000000075 | 0.515 | -2.551 | -9.773 |
| -1.475000000000075 | 0.51 | -2.553 | -9.774 |
| -1.470000000000075 | 0.505 | -2.556 | -9.775 |
| -1.465000000000075 | 0.5 | -2.559 | -9.777 |
| -1.460000000000075 | 0.495 | -2.561 | -9.778 |
| -1.455000000000076 | 0.49 | -2.564 | -9.78 |
| -1.450000000000076 | 0.485 | -2.566 | -9.781 |
| -1.445000000000076 | 0.48 | -2.569 | -9.782 |
| -1.440000000000076 | 0.475 | -2.571 | -9.784 |
| -1.435000000000076 | 0.471 | -2.574 | -9.785 |
| -1.430000000000076 | 0.466 | -2.576 | -9.786 |
| -1.425000000000076 | 0.461 | -2.578 | -9.788 |
| -1.420000000000076 | 0.456 | -2.581 | -9.789 |
| -1.415000000000076 | 0.451 | -2.583 | -9.79 |
| -1.410000000000077 | 0.447 | -2.585 | -9.792 |
| -1.405000000000077 | 0.442 | -2.588 | -9.793 |
| -1.400000000000077 | 0.437 | -2.59 | -9.794 |
| -1.395000000000077 | 0.433 | -2.592 | -9.795 |
| -1.390000000000077 | 0.428 | -2.595 | -9.797 |
| -1.385000000000077 | 0.424 | -2.597 | -9.798 |
| -1.380000000000077 | 0.419 | -2.599 | -9.799 |
| -1.375000000000077 | 0.415 | -2.601 | -9.8 |
| -1.370000000000077 | 0.41 | -2.604 | -9.801 |
| -1.365000000000077 | 0.406 | -2.606 | -9.803 |
| -1.360000000000078 | 0.401 | -2.608 | -9.804 |
| -1.355000000000078 | 0.397 | -2.61 | -9.805 |
| -1.350000000000078 | 0.392 | -2.612 | -9.806 |
| -1.345000000000078 | 0.388 | -2.614 | -9.807 |
| -1.340000000000078 | 0.384 | -2.616 | -9.808 |
| -1.335000000000078 | 0.379 | -2.618 | -9.809 |
| -1.330000000000078 | 0.375 | -2.621 | -9.811 |
| -1.325000000000078 | 0.371 | -2.623 | -9.812 |
| -1.320000000000078 | 0.367 | -2.625 | -9.813 |
| -1.315000000000079 | 0.363 | -2.627 | -9.814 |
| -1.310000000000079 | 0.358 | -2.629 | -9.815 |
| -1.305000000000079 | 0.354 | -2.63 | -9.816 |
| -1.300000000000079 | 0.35 | -2.632 | -9.817 |
| -1.295000000000079 | 0.346 | -2.634 | -9.818 |
| -1.29000000000008 | 0.342 | -2.636 | -9.819 |
| -1.285000000000079 | 0.338 | -2.638 | -9.82 |
| -1.280000000000079 | 0.334 | -2.64 | -9.821 |
| -1.275000000000079 | 0.33 | -2.642 | -9.822 |
| -1.270000000000079 | 0.326 | -2.644 | -9.823 |
| -1.26500000000008 | 0.322 | -2.646 | -9.824 |
| -1.26000000000008 | 0.318 | -2.647 | -9.825 |
| -1.25500000000008 | 0.315 | -2.649 | -9.826 |
| -1.25000000000008 | 0.311 | -2.651 | -9.827 |
| -1.24500000000008 | 0.307 | -2.653 | -9.828 |
| -1.24000000000008 | 0.303 | -2.654 | -9.828 |
| -1.23500000000008 | 0.299 | -2.656 | -9.829 |
| -1.23000000000008 | 0.296 | -2.658 | -9.83 |
| -1.22500000000008 | 0.292 | -2.659 | -9.831 |
| -1.220000000000081 | 0.288 | -2.661 | -9.832 |
| -1.215000000000081 | 0.285 | -2.663 | -9.833 |
| -1.210000000000081 | 0.281 | -2.664 | -9.834 |
| -1.205000000000081 | 0.278 | -2.666 | -9.835 |
| -1.200000000000081 | 0.274 | -2.668 | -9.835 |
| -1.195000000000081 | 0.27 | -2.669 | -9.836 |
| -1.190000000000081 | 0.267 | -2.671 | -9.837 |
| -1.185000000000081 | 0.263 | -2.672 | -9.838 |
| -1.180000000000081 | 0.26 | -2.674 | -9.839 |
| -1.175000000000082 | 0.257 | -2.675 | -9.839 |
| -1.170000000000082 | 0.253 | -2.677 | -9.84 |
| -1.165000000000082 | 0.25 | -2.678 | -9.841 |
| -1.160000000000082 | 0.247 | -2.68 | -9.842 |
| -1.155000000000082 | 0.243 | -2.681 | -9.842 |
| -1.150000000000082 | 0.24 | -2.683 | -9.843 |
| -1.145000000000082 | 0.237 | -2.684 | -9.844 |
| -1.140000000000082 | 0.233 | -2.685 | -9.845 |
| -1.135000000000082 | 0.23 | -2.687 | -9.845 |
| -1.130000000000082 | 0.227 | -2.688 | -9.846 |
| -1.125000000000083 | 0.224 | -2.69 | -9.847 |
| -1.120000000000083 | 0.221 | -2.691 | -9.847 |
| -1.115000000000083 | 0.218 | -2.692 | -9.848 |
| -1.110000000000083 | 0.215 | -2.694 | -9.849 |
| -1.105000000000083 | 0.212 | -2.695 | -9.849 |
| -1.100000000000083 | 0.209 | -2.696 | -9.85 |
| -1.095000000000083 | 0.206 | -2.697 | -9.851 |
| -1.090000000000083 | 0.203 | -2.699 | -9.851 |
| -1.085000000000083 | 0.2 | -2.7 | -9.852 |
| -1.080000000000084 | 0.197 | -2.701 | -9.853 |
| -1.075000000000084 | 0.194 | -2.702 | -9.853 |
| -1.070000000000084 | 0.191 | -2.704 | -9.854 |
| -1.065000000000084 | 0.188 | -2.705 | -9.855 |
| -1.060000000000084 | 0.185 | -2.706 | -9.855 |
| -1.055000000000084 | 0.182 | -2.707 | -9.856 |
| -1.050000000000084 | 0.18 | -2.708 | -9.856 |
| -1.045000000000084 | 0.177 | -2.709 | -9.857 |
| -1.040000000000084 | 0.174 | -2.71 | -9.857 |
| -1.035000000000085 | 0.172 | -2.712 | -9.858 |
| -1.030000000000085 | 0.169 | -2.713 | -9.859 |
| -1.025000000000085 | 0.166 | -2.714 | -9.859 |
| -1.020000000000085 | 0.164 | -2.715 | -9.86 |
| -1.015000000000085 | 0.161 | -2.716 | -9.86 |
| -1.010000000000085 | 0.158 | -2.717 | -9.861 |
| -1.005000000000085 | 0.156 | -2.718 | -9.861 |
| -1.000000000000085 | 0.153 | -2.719 | -9.862 |
| -0.995000000000085 | 0.151 | -2.72 | -9.862 |
| -0.990000000000085 | 0.148 | -2.721 | -9.863 |
| -0.985000000000085 | 0.146 | -2.722 | -9.863 |
| -0.980000000000085 | 0.144 | -2.723 | -9.864 |
| -0.975000000000085 | 0.141 | -2.724 | -9.864 |
| -0.970000000000085 | 0.139 | -2.725 | -9.865 |
| -0.965000000000085 | 0.137 | -2.726 | -9.865 |
| -0.960000000000085 | 0.134 | -2.726 | -9.865 |
| -0.955000000000085 | 0.132 | -2.727 | -9.866 |
| -0.950000000000085 | 0.13 | -2.728 | -9.866 |
| -0.945000000000085 | 0.127 | -2.729 | -9.867 |
| -0.940000000000085 | 0.125 | -2.73 | -9.867 |
| -0.935000000000085 | 0.123 | -2.731 | -9.868 |
| -0.930000000000085 | 0.121 | -2.732 | -9.868 |
| -0.925000000000085 | 0.119 | -2.732 | -9.868 |
| -0.920000000000085 | 0.117 | -2.733 | -9.869 |
| -0.915000000000085 | 0.114 | -2.734 | -9.869 |
| -0.910000000000085 | 0.112 | -2.735 | -9.87 |
| -0.905000000000085 | 0.11 | -2.736 | -9.87 |
| -0.900000000000085 | 0.108 | -2.736 | -9.87 |
| -0.895000000000085 | 0.106 | -2.737 | -9.871 |
| -0.890000000000085 | 0.104 | -2.738 | -9.871 |
| -0.885000000000085 | 0.102 | -2.739 | -9.871 |
| -0.880000000000085 | 0.1 | -2.739 | -9.872 |
| -0.875000000000085 | 0.099 | -2.74 | -9.872 |
| -0.870000000000085 | 0.097 | -2.741 | -9.872 |
| -0.865000000000085 | 0.095 | -2.741 | -9.873 |
| -0.860000000000085 | 0.093 | -2.742 | -9.873 |
| -0.855000000000085 | 0.091 | -2.743 | -9.873 |
| -0.850000000000085 | 0.089 | -2.743 | -9.874 |
| -0.845000000000085 | 0.088 | -2.744 | -9.874 |
| -0.840000000000085 | 0.086 | -2.745 | -9.874 |
| -0.835000000000085 | 0.084 | -2.745 | -9.875 |
| -0.830000000000085 | 0.082 | -2.746 | -9.875 |
| -0.825000000000085 | 0.081 | -2.747 | -9.875 |
| -0.820000000000085 | 0.079 | -2.747 | -9.876 |
| -0.815000000000085 | 0.077 | -2.748 | -9.876 |
| -0.810000000000085 | 0.076 | -2.748 | -9.876 |
| -0.805000000000085 | 0.074 | -2.749 | -9.876 |
| -0.800000000000085 | 0.073 | -2.749 | -9.877 |
| -0.795000000000085 | 0.071 | -2.75 | -9.877 |
| -0.790000000000085 | 0.07 | -2.751 | -9.877 |
| -0.785000000000085 | 0.068 | -2.751 | -9.877 |
| -0.780000000000085 | 0.067 | -2.752 | -9.878 |
| -0.775000000000085 | 0.065 | -2.752 | -9.878 |
| -0.770000000000085 | 0.064 | -2.753 | -9.878 |
| -0.765000000000085 | 0.062 | -2.753 | -9.878 |
| -0.760000000000085 | 0.061 | -2.754 | -9.879 |
| -0.755000000000085 | 0.059 | -2.754 | -9.879 |
| -0.750000000000085 | 0.058 | -2.754 | -9.879 |
| -0.745000000000085 | 0.057 | -2.755 | -9.879 |
| -0.740000000000085 | 0.055 | -2.755 | -9.88 |
| -0.735000000000085 | 0.054 | -2.756 | -9.88 |
| -0.730000000000085 | 0.053 | -2.756 | -9.88 |
| -0.725000000000085 | 0.052 | -2.757 | -9.88 |
| -0.720000000000085 | 0.05 | -2.757 | -9.88 |
| -0.715000000000085 | 0.049 | -2.758 | -9.881 |
| -0.710000000000085 | 0.048 | -2.758 | -9.881 |
| -0.705000000000085 | 0.047 | -2.758 | -9.881 |
| -0.700000000000085 | 0.046 | -2.759 | -9.881 |
| -0.695000000000085 | 0.044 | -2.759 | -9.881 |
| -0.690000000000085 | 0.043 | -2.759 | -9.881 |
| -0.685000000000085 | 0.042 | -2.76 | -9.882 |
| -0.680000000000085 | 0.041 | -2.76 | -9.882 |
| -0.675000000000085 | 0.04 | -2.761 | -9.882 |
| -0.670000000000085 | 0.039 | -2.761 | -9.882 |
| -0.665000000000085 | 0.038 | -2.761 | -9.882 |
| -0.660000000000085 | 0.037 | -2.762 | -9.882 |
| -0.655000000000085 | 0.036 | -2.762 | -9.883 |
| -0.650000000000085 | 0.035 | -2.762 | -9.883 |
| -0.645000000000085 | 0.034 | -2.762 | -9.883 |
| -0.640000000000085 | 0.033 | -2.763 | -9.883 |
| -0.635000000000085 | 0.032 | -2.763 | -9.883 |
| -0.630000000000085 | 0.031 | -2.763 | -9.883 |
| -0.625000000000085 | 0.03 | -2.764 | -9.883 |
| -0.620000000000085 | 0.03 | -2.764 | -9.884 |
| -0.615000000000085 | 0.029 | -2.764 | -9.884 |
| -0.610000000000085 | 0.028 | -2.764 | -9.884 |
| -0.605000000000085 | 0.027 | -2.765 | -9.884 |
| -0.600000000000085 | 0.026 | -2.765 | -9.884 |
| -0.595000000000085 | 0.025 | -2.765 | -9.884 |
| -0.590000000000085 | 0.025 | -2.765 | -9.884 |
| -0.585000000000085 | 0.024 | -2.766 | -9.884 |
| -0.580000000000085 | 0.023 | -2.766 | -9.884 |
| -0.575000000000085 | 0.022 | -2.766 | -9.885 |
| -0.570000000000085 | 0.022 | -2.766 | -9.885 |
| -0.565000000000085 | 0.021 | -2.767 | -9.885 |
| -0.560000000000085 | 0.02 | -2.767 | -9.885 |
| -0.555000000000085 | 0.02 | -2.767 | -9.885 |
| -0.550000000000085 | 0.019 | -2.767 | -9.885 |
| -0.545000000000085 | 0.018 | -2.767 | -9.885 |
| -0.540000000000085 | 0.018 | -2.768 | -9.885 |
| -0.535000000000085 | 0.017 | -2.768 | -9.885 |
| -0.530000000000085 | 0.017 | -2.768 | -9.885 |
| -0.525000000000085 | 0.016 | -2.768 | -9.885 |
| -0.520000000000085 | 0.016 | -2.768 | -9.886 |
| -0.515000000000085 | 0.015 | -2.768 | -9.886 |
| -0.510000000000085 | 0.014 | -2.769 | -9.886 |
| -0.505000000000085 | 0.014 | -2.769 | -9.886 |
| -0.500000000000085 | 0.013 | -2.769 | -9.886 |
| -0.495000000000085 | 0.013 | -2.769 | -9.886 |
| -0.490000000000085 | 0.012 | -2.769 | -9.886 |
| -0.485000000000085 | 0.012 | -2.769 | -9.886 |
| -0.480000000000085 | 0.012 | -2.769 | -9.886 |
| -0.475000000000085 | 0.011 | -2.77 | -9.886 |
| -0.470000000000085 | 0.011 | -2.77 | -9.886 |
| -0.465000000000085 | 0.01 | -2.77 | -9.886 |
| -0.460000000000085 | 0.01 | -2.77 | -9.886 |
| -0.455000000000085 | 0.009 | -2.77 | -9.886 |
| -0.450000000000085 | 0.009 | -2.77 | -9.886 |
| -0.445000000000085 | 0.009 | -2.77 | -9.886 |
| -0.440000000000085 | 0.008 | -2.77 | -9.886 |
| -0.435000000000085 | 0.008 | -2.77 | -9.887 |
| -0.430000000000085 | 0.008 | -2.771 | -9.887 |
| -0.425000000000085 | 0.007 | -2.771 | -9.887 |
| -0.420000000000085 | 0.007 | -2.771 | -9.887 |
| -0.415000000000085 | 0.007 | -2.771 | -9.887 |
| -0.410000000000085 | 0.006 | -2.771 | -9.887 |
| -0.405000000000085 | 0.006 | -2.771 | -9.887 |
| -0.400000000000085 | 0.006 | -2.771 | -9.887 |
| -0.395000000000085 | 0.006 | -2.771 | -9.887 |
| -0.390000000000085 | 0.005 | -2.771 | -9.887 |
| -0.385000000000085 | 0.005 | -2.771 | -9.887 |
| -0.380000000000085 | 0.005 | -2.771 | -9.887 |
| -0.375000000000085 | 0.005 | -2.771 | -9.887 |
| -0.370000000000085 | 0.004 | -2.771 | -9.887 |
| -0.365000000000085 | 0.004 | -2.772 | -9.887 |
| -0.360000000000085 | 0.004 | -2.772 | -9.887 |
| -0.355000000000085 | 0.004 | -2.772 | -9.887 |
| -0.350000000000085 | 0.003 | -2.772 | -9.887 |
| -0.345000000000085 | 0.003 | -2.772 | -9.887 |
| -0.340000000000085 | 0.003 | -2.772 | -9.887 |
| -0.335000000000085 | 0.003 | -2.772 | -9.887 |
| -0.330000000000085 | 0.003 | -2.772 | -9.887 |
| -0.325000000000085 | 0.003 | -2.772 | -9.887 |
| -0.320000000000085 | 0.002 | -2.772 | -9.887 |
| -0.315000000000085 | 0.002 | -2.772 | -9.887 |
| -0.310000000000085 | 0.002 | -2.772 | -9.887 |
| -0.305000000000085 | 0.002 | -2.772 | -9.887 |
| -0.300000000000085 | 0.002 | -2.772 | -9.887 |
| -0.295000000000085 | 0.002 | -2.772 | -9.887 |
| -0.290000000000085 | 0.002 | -2.772 | -9.887 |
| -0.285000000000085 | 0.002 | -2.772 | -9.887 |
| -0.280000000000085 | 0.001 | -2.772 | -9.887 |
| -0.275000000000085 | 0.001 | -2.772 | -9.887 |
| -0.270000000000085 | 0.001 | -2.772 | -9.887 |
| -0.265000000000085 | 0.001 | -2.772 | -9.887 |
| -0.260000000000085 | 0.001 | -2.772 | -9.887 |
| -0.255000000000085 | 0.001 | -2.772 | -9.887 |
| -0.250000000000085 | 0.001 | -2.772 | -9.887 |
| -0.245000000000085 | 0.001 | -2.772 | -9.887 |
| -0.240000000000085 | 0.001 | -2.772 | -9.887 |
| -0.235000000000085 | 0.001 | -2.772 | -9.887 |
| -0.230000000000085 | 0.001 | -2.772 | -9.887 |
| -0.225000000000085 | 0.001 | -2.772 | -9.887 |
| -0.220000000000085 | 0.001 | -2.772 | -9.887 |
| -0.215000000000085 | 0.001 | -2.772 | -9.887 |
| -0.210000000000085 | 0 | -2.772 | -9.887 |
| -0.205000000000085 | 0 | -2.772 | -9.887 |
| -0.200000000000085 | 0 | -2.772 | -9.887 |
| -0.195000000000085 | 0 | -2.772 | -9.887 |
| -0.190000000000085 | 0 | -2.773 | -9.887 |
| -0.185000000000085 | 0 | -2.773 | -9.887 |
| -0.180000000000085 | 0 | -2.773 | -9.887 |
| -0.175000000000085 | 0 | -2.773 | -9.887 |
| -0.170000000000085 | 0 | -2.773 | -9.887 |
| -0.165000000000085 | 0 | -2.773 | -9.887 |
| -0.160000000000085 | 0 | -2.773 | -9.887 |
| -0.155000000000084 | 0 | -2.773 | -9.887 |
| -0.150000000000084 | 0 | -2.773 | -9.887 |
| -0.145000000000084 | 0 | -2.773 | -9.887 |
| -0.140000000000084 | 0 | -2.773 | -9.887 |
| -0.135000000000084 | 0 | -2.773 | -9.888 |
| -0.130000000000084 | 0 | -2.773 | -9.888 |
| -0.125000000000084 | 0 | -2.773 | -9.888 |
| -0.120000000000084 | 0 | -2.773 | -9.888 |
| -0.115000000000084 | 0 | -2.773 | -9.888 |
| -0.110000000000084 | 0 | -2.773 | -9.888 |
| -0.105000000000084 | 0 | -2.773 | -9.888 |
| -0.100000000000084 | 0 | -2.773 | -9.888 |
| -0.0950000000000844 | 0 | -2.773 | -9.888 |
| -0.0900000000000844 | 0 | -2.773 | -9.888 |
| -0.0850000000000844 | 0 | -2.773 | -9.888 |
| -0.0800000000000844 | 0 | -2.773 | -9.888 |
| -0.0750000000000844 | 0 | -2.773 | -9.888 |
| -0.0700000000000844 | 0 | -2.773 | -9.888 |
| -0.0650000000000844 | 0 | -2.773 | -9.888 |
| -0.0600000000000844 | 0 | -2.773 | -9.888 |
| -0.0550000000000844 | 0 | -2.773 | -9.888 |
| -0.0500000000000844 | 0 | -2.773 | -9.888 |
| -0.0450000000000844 | 0 | -2.773 | -9.888 |
| -0.0400000000000844 | 0 | -2.773 | -9.888 |
| -0.0350000000000844 | 0 | -2.773 | -9.888 |
| -0.0300000000000844 | 0 | -2.773 | -9.888 |
| -0.0250000000000844 | 0 | -2.773 | -9.888 |
| -0.0200000000000844 | 0 | -2.773 | -9.888 |
| -0.0150000000000844 | 0 | -2.773 | -9.888 |
| -0.0100000000000844 | 0 | -2.773 | -9.888 |
| -0.00500000000008444 | 0 | -2.773 | -9.888 |
| -8.4444604087075e-14 | 0 | -2.773 | -9.888 |
| 0.00499999999991555 | 0 | -2.773 | -9.888 |
| 0.00999999999991555 | 0 | -2.773 | -9.888 |
| 0.0149999999999156 | 0 | -2.773 | -9.888 |
| 0.0199999999999156 | 0 | -2.773 | -9.888 |
| 0.0249999999999156 | 0 | -2.773 | -9.888 |
| 0.0299999999999156 | 0 | -2.773 | -9.888 |
| 0.0349999999999155 | 0 | -2.773 | -9.888 |
| 0.0399999999999155 | 0 | -2.773 | -9.888 |
| 0.0449999999999155 | 0 | -2.773 | -9.888 |
| 0.0499999999999155 | 0 | -2.773 | -9.888 |
| 0.0549999999999155 | 0 | -2.773 | -9.888 |
| 0.0599999999999155 | 0 | -2.773 | -9.888 |
| 0.0649999999999155 | 0 | -2.773 | -9.888 |
| 0.0699999999999155 | 0 | -2.773 | -9.888 |
| 0.0749999999999155 | 0 | -2.773 | -9.888 |
| 0.0799999999999155 | 0 | -2.773 | -9.888 |
| 0.0849999999999155 | 0 | -2.773 | -9.888 |
| 0.0899999999999155 | 0 | -2.773 | -9.888 |
| 0.0949999999999155 | 0 | -2.773 | -9.888 |
| 0.0999999999999155 | 0 | -2.773 | -9.888 |
| 0.104999999999916 | 0 | -2.773 | -9.888 |
| 0.109999999999916 | 0 | -2.773 | -9.888 |
| 0.114999999999916 | 0 | -2.773 | -9.888 |
| 0.119999999999916 | 0 | -2.773 | -9.888 |
| 0.124999999999916 | 0 | -2.773 | -9.888 |
| 0.129999999999916 | 0 | -2.773 | -9.888 |
| 0.134999999999916 | 0 | -2.773 | -9.888 |
| 0.139999999999916 | 0 | -2.773 | -9.887 |
| 0.144999999999916 | 0 | -2.773 | -9.887 |
| 0.149999999999916 | 0 | -2.773 | -9.887 |
| 0.154999999999916 | 0 | -2.773 | -9.887 |
| 0.159999999999916 | 0 | -2.773 | -9.887 |
| 0.164999999999916 | 0 | -2.773 | -9.887 |
| 0.169999999999916 | 0 | -2.773 | -9.887 |
| 0.174999999999916 | 0 | -2.773 | -9.887 |
| 0.179999999999916 | 0 | -2.773 | -9.887 |
| 0.184999999999916 | 0 | -2.773 | -9.887 |
| 0.189999999999916 | 0 | -2.773 | -9.887 |
| 0.194999999999916 | 0 | -2.772 | -9.887 |
| 0.199999999999916 | 0 | -2.772 | -9.887 |
| 0.204999999999916 | 0 | -2.772 | -9.887 |
| 0.209999999999916 | 0 | -2.772 | -9.887 |
| 0.214999999999916 | 0.001 | -2.772 | -9.887 |
| 0.219999999999916 | 0.001 | -2.772 | -9.887 |
| 0.224999999999916 | 0.001 | -2.772 | -9.887 |
| 0.229999999999916 | 0.001 | -2.772 | -9.887 |
| 0.234999999999916 | 0.001 | -2.772 | -9.887 |
| 0.239999999999916 | 0.001 | -2.772 | -9.887 |
| 0.244999999999916 | 0.001 | -2.772 | -9.887 |
| 0.249999999999916 | 0.001 | -2.772 | -9.887 |
| 0.254999999999916 | 0.001 | -2.772 | -9.887 |
| 0.259999999999916 | 0.001 | -2.772 | -9.887 |
| 0.264999999999916 | 0.001 | -2.772 | -9.887 |
| 0.269999999999916 | 0.001 | -2.772 | -9.887 |
| 0.274999999999916 | 0.001 | -2.772 | -9.887 |
| 0.279999999999916 | 0.001 | -2.772 | -9.887 |
| 0.284999999999916 | 0.002 | -2.772 | -9.887 |
| 0.289999999999916 | 0.002 | -2.772 | -9.887 |
| 0.294999999999916 | 0.002 | -2.772 | -9.887 |
| 0.299999999999916 | 0.002 | -2.772 | -9.887 |
| 0.304999999999916 | 0.002 | -2.772 | -9.887 |
| 0.309999999999916 | 0.002 | -2.772 | -9.887 |
| 0.314999999999916 | 0.002 | -2.772 | -9.887 |
| 0.319999999999916 | 0.002 | -2.772 | -9.887 |
| 0.324999999999916 | 0.003 | -2.772 | -9.887 |
| 0.329999999999916 | 0.003 | -2.772 | -9.887 |
| 0.334999999999916 | 0.003 | -2.772 | -9.887 |
| 0.339999999999916 | 0.003 | -2.772 | -9.887 |
| 0.344999999999916 | 0.003 | -2.772 | -9.887 |
| 0.349999999999916 | 0.003 | -2.772 | -9.887 |
| 0.354999999999916 | 0.004 | -2.772 | -9.887 |
| 0.359999999999916 | 0.004 | -2.772 | -9.887 |
| 0.364999999999916 | 0.004 | -2.772 | -9.887 |
| 0.369999999999916 | 0.004 | -2.771 | -9.887 |
| 0.374999999999916 | 0.005 | -2.771 | -9.887 |
| 0.379999999999916 | 0.005 | -2.771 | -9.887 |
| 0.384999999999916 | 0.005 | -2.771 | -9.887 |
| 0.389999999999916 | 0.005 | -2.771 | -9.887 |
| 0.394999999999916 | 0.006 | -2.771 | -9.887 |
| 0.399999999999916 | 0.006 | -2.771 | -9.887 |
| 0.404999999999916 | 0.006 | -2.771 | -9.887 |
| 0.409999999999916 | 0.006 | -2.771 | -9.887 |
| 0.414999999999916 | 0.007 | -2.771 | -9.887 |
| 0.419999999999916 | 0.007 | -2.771 | -9.887 |
| 0.424999999999916 | 0.007 | -2.771 | -9.887 |
| 0.429999999999916 | 0.008 | -2.771 | -9.887 |
| 0.434999999999916 | 0.008 | -2.77 | -9.887 |
| 0.439999999999916 | 0.008 | -2.77 | -9.886 |
| 0.444999999999916 | 0.009 | -2.77 | -9.886 |
| 0.449999999999916 | 0.009 | -2.77 | -9.886 |
| 0.454999999999916 | 0.009 | -2.77 | -9.886 |
| 0.459999999999916 | 0.01 | -2.77 | -9.886 |
| 0.464999999999916 | 0.01 | -2.77 | -9.886 |
| 0.469999999999916 | 0.011 | -2.77 | -9.886 |
| 0.474999999999916 | 0.011 | -2.77 | -9.886 |
| 0.479999999999916 | 0.012 | -2.769 | -9.886 |
| 0.484999999999916 | 0.012 | -2.769 | -9.886 |
| 0.489999999999916 | 0.012 | -2.769 | -9.886 |
| 0.494999999999916 | 0.013 | -2.769 | -9.886 |
| 0.499999999999916 | 0.013 | -2.769 | -9.886 |
| 0.504999999999916 | 0.014 | -2.769 | -9.886 |
| 0.509999999999916 | 0.014 | -2.769 | -9.886 |
| 0.514999999999916 | 0.015 | -2.768 | -9.886 |
| 0.519999999999916 | 0.016 | -2.768 | -9.886 |
| 0.524999999999916 | 0.016 | -2.768 | -9.885 |
| 0.529999999999916 | 0.017 | -2.768 | -9.885 |
| 0.534999999999916 | 0.017 | -2.768 | -9.885 |
| 0.539999999999916 | 0.018 | -2.768 | -9.885 |
| 0.544999999999916 | 0.018 | -2.767 | -9.885 |
| 0.549999999999916 | 0.019 | -2.767 | -9.885 |
| 0.554999999999916 | 0.02 | -2.767 | -9.885 |
| 0.559999999999916 | 0.02 | -2.767 | -9.885 |
| 0.564999999999916 | 0.021 | -2.767 | -9.885 |
| 0.569999999999916 | 0.022 | -2.766 | -9.885 |
| 0.574999999999916 | 0.022 | -2.766 | -9.885 |
| 0.579999999999916 | 0.023 | -2.766 | -9.884 |
| 0.584999999999916 | 0.024 | -2.766 | -9.884 |
| 0.589999999999916 | 0.025 | -2.765 | -9.884 |
| 0.594999999999916 | 0.025 | -2.765 | -9.884 |
| 0.599999999999916 | 0.026 | -2.765 | -9.884 |
| 0.604999999999916 | 0.027 | -2.765 | -9.884 |
| 0.609999999999916 | 0.028 | -2.764 | -9.884 |
| 0.614999999999916 | 0.029 | -2.764 | -9.884 |
| 0.619999999999916 | 0.03 | -2.764 | -9.884 |
| 0.624999999999916 | 0.03 | -2.764 | -9.883 |
| 0.629999999999916 | 0.031 | -2.763 | -9.883 |
| 0.634999999999916 | 0.032 | -2.763 | -9.883 |
| 0.639999999999916 | 0.033 | -2.763 | -9.883 |
| 0.644999999999916 | 0.034 | -2.762 | -9.883 |
| 0.649999999999916 | 0.035 | -2.762 | -9.883 |
| 0.654999999999916 | 0.036 | -2.762 | -9.883 |
| 0.659999999999916 | 0.037 | -2.762 | -9.882 |
| 0.664999999999916 | 0.038 | -2.761 | -9.882 |
| 0.669999999999916 | 0.039 | -2.761 | -9.882 |
| 0.674999999999916 | 0.04 | -2.761 | -9.882 |
| 0.679999999999916 | 0.041 | -2.76 | -9.882 |
| 0.684999999999916 | 0.042 | -2.76 | -9.882 |
| 0.689999999999916 | 0.043 | -2.759 | -9.881 |
| 0.694999999999916 | 0.044 | -2.759 | -9.881 |
| 0.699999999999916 | 0.046 | -2.759 | -9.881 |
| 0.704999999999916 | 0.047 | -2.758 | -9.881 |
| 0.709999999999916 | 0.048 | -2.758 | -9.881 |
| 0.714999999999916 | 0.049 | -2.758 | -9.881 |
| 0.719999999999916 | 0.05 | -2.757 | -9.88 |
| 0.724999999999916 | 0.052 | -2.757 | -9.88 |
| 0.729999999999916 | 0.053 | -2.756 | -9.88 |
| 0.734999999999916 | 0.054 | -2.756 | -9.88 |
| 0.739999999999916 | 0.055 | -2.755 | -9.88 |
| 0.744999999999916 | 0.057 | -2.755 | -9.879 |
| 0.749999999999916 | 0.058 | -2.754 | -9.879 |
| 0.754999999999916 | 0.059 | -2.754 | -9.879 |
| 0.759999999999916 | 0.061 | -2.754 | -9.879 |
| 0.764999999999916 | 0.062 | -2.753 | -9.878 |
| 0.769999999999916 | 0.064 | -2.753 | -9.878 |
| 0.774999999999916 | 0.065 | -2.752 | -9.878 |
| 0.779999999999916 | 0.067 | -2.752 | -9.878 |
| 0.784999999999916 | 0.068 | -2.751 | -9.877 |
| 0.789999999999916 | 0.07 | -2.751 | -9.877 |
| 0.794999999999916 | 0.071 | -2.75 | -9.877 |
| 0.799999999999916 | 0.073 | -2.749 | -9.877 |
| 0.804999999999916 | 0.074 | -2.749 | -9.876 |
| 0.809999999999916 | 0.076 | -2.748 | -9.876 |
| 0.814999999999916 | 0.077 | -2.748 | -9.876 |
| 0.819999999999916 | 0.079 | -2.747 | -9.876 |
| 0.824999999999916 | 0.081 | -2.747 | -9.875 |
| 0.829999999999916 | 0.082 | -2.746 | -9.875 |
| 0.834999999999916 | 0.084 | -2.745 | -9.875 |
| 0.839999999999916 | 0.086 | -2.745 | -9.874 |
| 0.844999999999916 | 0.088 | -2.744 | -9.874 |
| 0.849999999999916 | 0.089 | -2.743 | -9.874 |
| 0.854999999999916 | 0.091 | -2.743 | -9.873 |
| 0.859999999999916 | 0.093 | -2.742 | -9.873 |
| 0.864999999999916 | 0.095 | -2.741 | -9.873 |
| 0.869999999999916 | 0.097 | -2.741 | -9.872 |
| 0.874999999999916 | 0.099 | -2.74 | -9.872 |
| 0.879999999999916 | 0.1 | -2.739 | -9.872 |
| 0.884999999999916 | 0.102 | -2.739 | -9.871 |
| 0.889999999999916 | 0.104 | -2.738 | -9.871 |
| 0.894999999999916 | 0.106 | -2.737 | -9.871 |
| 0.899999999999916 | 0.108 | -2.736 | -9.87 |
| 0.904999999999916 | 0.11 | -2.736 | -9.87 |
| 0.909999999999916 | 0.112 | -2.735 | -9.87 |
| 0.914999999999916 | 0.114 | -2.734 | -9.869 |
| 0.919999999999916 | 0.117 | -2.733 | -9.869 |
| 0.924999999999916 | 0.119 | -2.732 | -9.868 |
| 0.929999999999916 | 0.121 | -2.732 | -9.868 |
| 0.934999999999916 | 0.123 | -2.731 | -9.868 |
| 0.939999999999916 | 0.125 | -2.73 | -9.867 |
| 0.944999999999916 | 0.127 | -2.729 | -9.867 |
| 0.949999999999916 | 0.13 | -2.728 | -9.866 |
| 0.954999999999916 | 0.132 | -2.727 | -9.866 |
| 0.959999999999916 | 0.134 | -2.726 | -9.865 |
| 0.964999999999916 | 0.137 | -2.726 | -9.865 |
| 0.969999999999916 | 0.139 | -2.725 | -9.865 |
| 0.974999999999916 | 0.141 | -2.724 | -9.864 |
| 0.979999999999916 | 0.144 | -2.723 | -9.864 |
| 0.984999999999916 | 0.146 | -2.722 | -9.863 |
| 0.989999999999916 | 0.148 | -2.721 | -9.863 |
| 0.994999999999916 | 0.151 | -2.72 | -9.862 |
| 0.999999999999916 | 0.153 | -2.719 | -9.862 |
| 1.004999999999916 | 0.156 | -2.718 | -9.861 |
| 1.009999999999916 | 0.158 | -2.717 | -9.861 |
| 1.014999999999916 | 0.161 | -2.716 | -9.86 |
| 1.019999999999916 | 0.164 | -2.715 | -9.86 |
| 1.024999999999916 | 0.166 | -2.714 | -9.859 |
| 1.029999999999916 | 0.169 | -2.713 | -9.859 |
| 1.034999999999916 | 0.172 | -2.712 | -9.858 |
| 1.039999999999915 | 0.174 | -2.71 | -9.857 |
| 1.044999999999915 | 0.177 | -2.709 | -9.857 |
| 1.049999999999915 | 0.18 | -2.708 | -9.856 |
| 1.054999999999915 | 0.182 | -2.707 | -9.856 |
| 1.059999999999915 | 0.185 | -2.706 | -9.855 |
| 1.064999999999915 | 0.188 | -2.705 | -9.855 |
| 1.069999999999915 | 0.191 | -2.704 | -9.854 |
| 1.074999999999915 | 0.194 | -2.702 | -9.853 |
| 1.079999999999915 | 0.197 | -2.701 | -9.853 |
| 1.084999999999914 | 0.2 | -2.7 | -9.852 |
| 1.089999999999914 | 0.203 | -2.699 | -9.851 |
| 1.094999999999914 | 0.206 | -2.697 | -9.851 |
| 1.099999999999914 | 0.209 | -2.696 | -9.85 |
| 1.104999999999914 | 0.212 | -2.695 | -9.849 |
| 1.109999999999914 | 0.215 | -2.694 | -9.849 |
| 1.114999999999914 | 0.218 | -2.692 | -9.848 |
| 1.119999999999914 | 0.221 | -2.691 | -9.847 |
| 1.124999999999914 | 0.224 | -2.69 | -9.847 |
| 1.129999999999914 | 0.227 | -2.688 | -9.846 |
| 1.134999999999913 | 0.23 | -2.687 | -9.845 |
| 1.139999999999913 | 0.233 | -2.685 | -9.845 |
| 1.144999999999913 | 0.237 | -2.684 | -9.844 |
| 1.149999999999913 | 0.24 | -2.683 | -9.843 |
| 1.154999999999913 | 0.243 | -2.681 | -9.842 |
| 1.159999999999913 | 0.247 | -2.68 | -9.842 |
| 1.164999999999913 | 0.25 | -2.678 | -9.841 |
| 1.169999999999913 | 0.253 | -2.677 | -9.84 |
| 1.174999999999913 | 0.257 | -2.675 | -9.839 |
| 1.179999999999912 | 0.26 | -2.674 | -9.839 |
| 1.184999999999912 | 0.263 | -2.672 | -9.838 |
| 1.189999999999912 | 0.267 | -2.671 | -9.837 |
| 1.194999999999912 | 0.27 | -2.669 | -9.836 |
| 1.199999999999912 | 0.274 | -2.668 | -9.835 |
| 1.204999999999912 | 0.278 | -2.666 | -9.835 |
| 1.209999999999912 | 0.281 | -2.664 | -9.834 |
| 1.214999999999912 | 0.285 | -2.663 | -9.833 |
| 1.219999999999912 | 0.288 | -2.661 | -9.832 |
| 1.224999999999911 | 0.292 | -2.659 | -9.831 |
| 1.229999999999911 | 0.296 | -2.658 | -9.83 |
| 1.234999999999911 | 0.299 | -2.656 | -9.829 |
| 1.239999999999911 | 0.303 | -2.654 | -9.828 |
| 1.244999999999911 | 0.307 | -2.653 | -9.828 |
| 1.249999999999911 | 0.311 | -2.651 | -9.827 |
| 1.254999999999911 | 0.315 | -2.649 | -9.826 |
| 1.259999999999911 | 0.318 | -2.647 | -9.825 |
| 1.264999999999911 | 0.322 | -2.646 | -9.824 |
| 1.269999999999911 | 0.326 | -2.644 | -9.823 |
| 1.27499999999991 | 0.33 | -2.642 | -9.822 |
| 1.27999999999991 | 0.334 | -2.64 | -9.821 |
| 1.28499999999991 | 0.338 | -2.638 | -9.82 |
| 1.28999999999991 | 0.342 | -2.636 | -9.819 |
| 1.29499999999991 | 0.346 | -2.634 | -9.818 |
| 1.29999999999991 | 0.35 | -2.632 | -9.817 |
| 1.30499999999991 | 0.354 | -2.63 | -9.816 |
| 1.30999999999991 | 0.358 | -2.629 | -9.815 |
| 1.31499999999991 | 0.363 | -2.627 | -9.814 |
| 1.319999999999909 | 0.367 | -2.625 | -9.813 |
| 1.324999999999909 | 0.371 | -2.623 | -9.812 |
| 1.329999999999909 | 0.375 | -2.621 | -9.811 |
| 1.334999999999909 | 0.379 | -2.618 | -9.809 |
| 1.339999999999909 | 0.384 | -2.616 | -9.808 |
| 1.344999999999909 | 0.388 | -2.614 | -9.807 |
| 1.349999999999909 | 0.392 | -2.612 | -9.806 |
| 1.354999999999909 | 0.397 | -2.61 | -9.805 |
| 1.359999999999909 | 0.401 | -2.608 | -9.804 |
| 1.364999999999908 | 0.406 | -2.606 | -9.803 |
| 1.369999999999908 | 0.41 | -2.604 | -9.801 |
| 1.374999999999908 | 0.415 | -2.601 | -9.8 |
| 1.379999999999908 | 0.419 | -2.599 | -9.799 |
| 1.384999999999908 | 0.424 | -2.597 | -9.798 |
| 1.389999999999908 | 0.428 | -2.595 | -9.797 |
| 1.394999999999908 | 0.433 | -2.592 | -9.795 |
| 1.399999999999908 | 0.437 | -2.59 | -9.794 |
| 1.404999999999908 | 0.442 | -2.588 | -9.793 |
| 1.409999999999908 | 0.447 | -2.585 | -9.792 |
| 1.414999999999907 | 0.451 | -2.583 | -9.79 |
| 1.419999999999907 | 0.456 | -2.581 | -9.789 |
| 1.424999999999907 | 0.461 | -2.578 | -9.788 |
| 1.429999999999907 | 0.466 | -2.576 | -9.786 |
| 1.434999999999907 | 0.471 | -2.574 | -9.785 |
| 1.439999999999907 | 0.475 | -2.571 | -9.784 |
| 1.444999999999907 | 0.48 | -2.569 | -9.782 |
| 1.449999999999907 | 0.485 | -2.566 | -9.781 |
| 1.454999999999907 | 0.49 | -2.564 | -9.78 |
| 1.459999999999906 | 0.495 | -2.561 | -9.778 |
| 1.464999999999906 | 0.5 | -2.559 | -9.777 |
| 1.469999999999906 | 0.505 | -2.556 | -9.775 |
| 1.474999999999906 | 0.51 | -2.553 | -9.774 |
| 1.479999999999906 | 0.515 | -2.551 | -9.773 |
| 1.484999999999906 | 0.52 | -2.548 | -9.771 |
| 1.489999999999906 | 0.525 | -2.546 | -9.77 |
| 1.494999999999906 | 0.53 | -2.543 | -9.768 |
| 1.499999999999906 | 0.536 | -2.54 | -9.767 |
| 1.504999999999906 | 0.541 | -2.537 | -9.765 |
| 1.509999999999905 | 0.546 | -2.535 | -9.764 |
| 1.514999999999905 | 0.551 | -2.532 | -9.762 |
| 1.519999999999905 | 0.557 | -2.529 | -9.761 |
| 1.524999999999905 | 0.562 | -2.526 | -9.759 |
| 1.529999999999905 | 0.567 | -2.524 | -9.757 |
| 1.534999999999905 | 0.573 | -2.521 | -9.756 |
| 1.539999999999905 | 0.578 | -2.518 | -9.754 |
| 1.544999999999905 | 0.584 | -2.515 | -9.753 |
| 1.549999999999905 | 0.589 | -2.512 | -9.751 |
| 1.554999999999904 | 0.594 | -2.509 | -9.749 |
| 1.559999999999904 | 0.6 | -2.506 | -9.748 |
| 1.564999999999904 | 0.606 | -2.503 | -9.746 |
| 1.569999999999904 | 0.611 | -2.5 | -9.744 |
| 1.574999999999904 | 0.617 | -2.497 | -9.743 |
| 1.579999999999904 | 0.622 | -2.494 | -9.741 |
| 1.584999999999904 | 0.628 | -2.491 | -9.739 |
| 1.589999999999904 | 0.634 | -2.488 | -9.737 |
| 1.594999999999904 | 0.639 | -2.485 | -9.736 |
| 1.599999999999903 | 0.645 | -2.482 | -9.734 |
| 1.604999999999903 | 0.651 | -2.479 | -9.732 |
| 1.609999999999903 | 0.657 | -2.476 | -9.73 |
| 1.614999999999903 | 0.663 | -2.473 | -9.729 |
| 1.619999999999903 | 0.668 | -2.469 | -9.727 |
| 1.624999999999903 | 0.674 | -2.466 | -9.725 |
| 1.629999999999903 | 0.68 | -2.463 | -9.723 |
| 1.634999999999903 | 0.686 | -2.46 | -9.721 |
| 1.639999999999903 | 0.692 | -2.456 | -9.719 |
| 1.644999999999902 | 0.698 | -2.453 | -9.717 |
| 1.649999999999902 | 0.704 | -2.45 | -9.716 |
| 1.654999999999902 | 0.71 | -2.446 | -9.714 |
| 1.659999999999902 | 0.716 | -2.443 | -9.712 |
| 1.664999999999902 | 0.722 | -2.44 | -9.71 |
| 1.669999999999902 | 0.728 | -2.436 | -9.708 |
| 1.674999999999902 | 0.735 | -2.433 | -9.706 |
| 1.679999999999902 | 0.741 | -2.429 | -9.704 |
| 1.684999999999902 | 0.747 | -2.426 | -9.702 |
| 1.689999999999901 | 0.753 | -2.422 | -9.7 |
| 1.694999999999901 | 0.759 | -2.419 | -9.698 |
| 1.699999999999901 | 0.766 | -2.415 | -9.696 |
| 1.704999999999901 | 0.772 | -2.412 | -9.694 |
| 1.709999999999901 | 0.778 | -2.408 | -9.691 |
| 1.714999999999901 | 0.785 | -2.404 | -9.689 |
| 1.719999999999901 | 0.791 | -2.401 | -9.687 |
| 1.724999999999901 | 0.798 | -2.397 | -9.685 |
| 1.729999999999901 | 0.804 | -2.393 | -9.683 |
| 1.734999999999901 | 0.811 | -2.39 | -9.681 |
| 1.7399999999999 | 0.817 | -2.386 | -9.679 |
| 1.7449999999999 | 0.824 | -2.382 | -9.676 |
| 1.7499999999999 | 0.83 | -2.378 | -9.674 |
| 1.7549999999999 | 0.837 | -2.375 | -9.672 |
| 1.7599999999999 | 0.844 | -2.371 | -9.67 |
| 1.7649999999999 | 0.85 | -2.367 | -9.667 |
| 1.7699999999999 | 0.857 | -2.363 | -9.665 |
| 1.7749999999999 | 0.864 | -2.359 | -9.663 |
| 1.7799999999999 | 0.87 | -2.355 | -9.661 |
| 1.784999999999899 | 0.877 | -2.351 | -9.658 |
| 1.789999999999899 | 0.884 | -2.347 | -9.656 |
| 1.794999999999899 | 0.891 | -2.343 | -9.654 |
| 1.799999999999899 | 0.898 | -2.339 | -9.651 |
| 1.804999999999899 | 0.905 | -2.335 | -9.649 |
| 1.809999999999899 | 0.912 | -2.331 | -9.646 |
| 1.814999999999899 | 0.918 | -2.327 | -9.644 |
| 1.819999999999899 | 0.925 | -2.323 | -9.642 |
| 1.824999999999899 | 0.932 | -2.319 | -9.639 |
| 1.829999999999899 | 0.939 | -2.315 | -9.637 |
| 1.834999999999898 | 0.947 | -2.31 | -9.634 |
| 1.839999999999898 | 0.954 | -2.306 | -9.632 |
| 1.844999999999898 | 0.961 | -2.302 | -9.629 |
| 1.849999999999898 | 0.968 | -2.298 | -9.627 |
| 1.854999999999898 | 0.975 | -2.294 | -9.624 |
| 1.859999999999898 | 0.982 | -2.289 | -9.621 |
| 1.864999999999898 | 0.989 | -2.285 | -9.619 |
| 1.869999999999898 | 0.997 | -2.281 | -9.616 |
| 1.874999999999898 | 1.004 | -2.276 | -9.614 |
| 1.879999999999897 | 1.011 | -2.272 | -9.611 |
| 1.884999999999897 | 1.019 | -2.267 | -9.608 |
| 1.889999999999897 | 1.026 | -2.263 | -9.606 |
| 1.894999999999897 | 1.033 | -2.258 | -9.603 |
| 1.899999999999897 | 1.041 | -2.254 | -9.6 |
| 1.904999999999897 | 1.048 | -2.249 | -9.597 |
| 1.909999999999897 | 1.056 | -2.245 | -9.595 |
| 1.914999999999897 | 1.063 | -2.24 | -9.592 |
| 1.919999999999897 | 1.071 | -2.236 | -9.589 |
| 1.924999999999897 | 1.078 | -2.231 | -9.586 |
| 1.929999999999896 | 1.086 | -2.226 | -9.584 |
| 1.934999999999896 | 1.094 | -2.222 | -9.581 |
| 1.939999999999896 | 1.101 | -2.217 | -9.578 |
| 1.944999999999896 | 1.109 | -2.212 | -9.575 |
| 1.949999999999896 | 1.117 | -2.208 | -9.572 |
| 1.954999999999896 | 1.124 | -2.203 | -9.569 |
| 1.959999999999896 | 1.132 | -2.198 | -9.566 |
| 1.964999999999896 | 1.14 | -2.193 | -9.563 |
| 1.969999999999896 | 1.148 | -2.188 | -9.56 |
| 1.974999999999895 | 1.156 | -2.184 | -9.557 |
| 1.979999999999895 | 1.164 | -2.179 | -9.554 |
| 1.984999999999895 | 1.171 | -2.174 | -9.551 |
| 1.989999999999895 | 1.179 | -2.169 | -9.548 |
| 1.994999999999895 | 1.187 | -2.164 | -9.545 |
| 1.999999999999895 | 1.195 | -2.159 | -9.542 |
| 2.004999999999895 | 1.203 | -2.154 | -9.539 |
| 2.009999999999895 | 1.211 | -2.149 | -9.536 |
| 2.014999999999895 | 1.219 | -2.144 | -9.533 |
| 2.019999999999895 | 1.228 | -2.139 | -9.53 |
| 2.024999999999895 | 1.236 | -2.134 | -9.527 |
| 2.029999999999895 | 1.244 | -2.128 | -9.523 |
| 2.034999999999894 | 1.252 | -2.123 | -9.52 |
| 2.039999999999894 | 1.26 | -2.118 | -9.517 |
| 2.044999999999894 | 1.268 | -2.113 | -9.514 |
| 2.049999999999894 | 1.277 | -2.108 | -9.511 |
| 2.054999999999894 | 1.285 | -2.102 | -9.507 |
| 2.059999999999894 | 1.293 | -2.097 | -9.504 |
| 2.064999999999894 | 1.302 | -2.092 | -9.501 |
| 2.069999999999894 | 1.31 | -2.086 | -9.497 |
| 2.074999999999894 | 1.318 | -2.081 | -9.494 |
| 2.079999999999893 | 1.327 | -2.076 | -9.491 |
| 2.084999999999893 | 1.335 | -2.07 | -9.487 |
| 2.089999999999893 | 1.344 | -2.065 | -9.484 |
| 2.094999999999893 | 1.352 | -2.059 | -9.48 |
| 2.099999999999893 | 1.361 | -2.054 | -9.477 |
| 2.104999999999893 | 1.369 | -2.048 | -9.474 |
| 2.109999999999893 | 1.378 | -2.043 | -9.47 |
| 2.114999999999893 | 1.387 | -2.037 | -9.467 |
| 2.119999999999893 | 1.395 | -2.032 | -9.463 |
| 2.124999999999893 | 1.404 | -2.026 | -9.459 |
| 2.129999999999892 | 1.413 | -2.02 | -9.456 |
| 2.134999999999892 | 1.421 | -2.015 | -9.452 |
| 2.139999999999892 | 1.43 | -2.009 | -9.449 |
| 2.144999999999892 | 1.439 | -2.003 | -9.445 |
| 2.149999999999892 | 1.448 | -1.998 | -9.442 |
| 2.154999999999892 | 1.457 | -1.992 | -9.438 |
| 2.159999999999892 | 1.466 | -1.986 | -9.434 |
| 2.164999999999892 | 1.475 | -1.98 | -9.43 |
| 2.169999999999892 | 1.483 | -1.974 | -9.427 |
| 2.174999999999891 | 1.492 | -1.968 | -9.423 |
| 2.179999999999891 | 1.501 | -1.962 | -9.419 |
| 2.184999999999891 | 1.51 | -1.957 | -9.415 |
| 2.189999999999891 | 1.519 | -1.951 | -9.412 |
| 2.194999999999891 | 1.529 | -1.945 | -9.408 |
| 2.199999999999891 | 1.538 | -1.939 | -9.404 |
| 2.204999999999891 | 1.547 | -1.933 | -9.4 |
| 2.209999999999891 | 1.556 | -1.926 | -9.396 |
| 2.214999999999891 | 1.565 | -1.92 | -9.392 |
| 2.21999999999989 | 1.574 | -1.914 | -9.388 |
| 2.22499999999989 | 1.584 | -1.908 | -9.385 |
| 2.22999999999989 | 1.593 | -1.902 | -9.381 |
| 2.23499999999989 | 1.602 | -1.896 | -9.377 |
| 2.23999999999989 | 1.611 | -1.89 | -9.373 |
| 2.24499999999989 | 1.621 | -1.883 | -9.369 |
| 2.24999999999989 | 1.63 | -1.877 | -9.365 |
| 2.25499999999989 | 1.64 | -1.871 | -9.36 |
| 2.25999999999989 | 1.649 | -1.864 | -9.356 |
| 2.26499999999989 | 1.658 | -1.858 | -9.352 |
| 2.269999999999889 | 1.668 | -1.852 | -9.348 |
| 2.274999999999889 | 1.678 | -1.845 | -9.344 |
| 2.279999999999889 | 1.687 | -1.839 | -9.34 |
| 2.284999999999889 | 1.697 | -1.832 | -9.336 |
| 2.289999999999889 | 1.706 | -1.826 | -9.331 |
| 2.294999999999889 | 1.716 | -1.819 | -9.327 |
| 2.299999999999889 | 1.726 | -1.813 | -9.323 |
| 2.304999999999889 | 1.735 | -1.806 | -9.319 |
| 2.309999999999889 | 1.745 | -1.8 | -9.314 |
| 2.314999999999888 | 1.755 | -1.793 | -9.31 |
| 2.319999999999888 | 1.764 | -1.786 | -9.306 |
| 2.324999999999888 | 1.774 | -1.78 | -9.301 |
| 2.329999999999888 | 1.784 | -1.773 | -9.297 |
| 2.334999999999888 | 1.794 | -1.766 | -9.293 |
| 2.339999999999888 | 1.804 | -1.76 | -9.288 |
| 2.344999999999888 | 1.814 | -1.753 | -9.284 |
| 2.349999999999888 | 1.824 | -1.746 | -9.279 |
| 2.354999999999888 | 1.834 | -1.739 | -9.275 |
| 2.359999999999887 | 1.844 | -1.732 | -9.27 |
| 2.364999999999887 | 1.854 | -1.726 | -9.266 |
| 2.369999999999887 | 1.864 | -1.719 | -9.261 |
| 2.374999999999887 | 1.874 | -1.712 | -9.257 |
| 2.379999999999887 | 1.884 | -1.705 | -9.252 |
| 2.384999999999887 | 1.894 | -1.698 | -9.248 |
| 2.389999999999887 | 1.904 | -1.691 | -9.243 |
| 2.394999999999887 | 1.914 | -1.684 | -9.238 |
| 2.399999999999887 | 1.924 | -1.677 | -9.234 |
| 2.404999999999887 | 1.935 | -1.669 | -9.229 |
| 2.409999999999886 | 1.945 | -1.662 | -9.224 |
| 2.414999999999886 | 1.955 | -1.655 | -9.219 |
| 2.419999999999886 | 1.966 | -1.648 | -9.215 |
| 2.424999999999886 | 1.976 | -1.641 | -9.21 |
| 2.429999999999886 | 1.986 | -1.634 | -9.205 |
| 2.434999999999886 | 1.997 | -1.626 | -9.2 |
| 2.439999999999886 | 2.007 | -1.619 | -9.195 |
| 2.444999999999886 | 2.018 | -1.612 | -9.191 |
| 2.449999999999886 | 2.028 | -1.604 | -9.186 |
| 2.454999999999885 | 2.039 | -1.597 | -9.181 |
| 2.459999999999885 | 2.049 | -1.59 | -9.176 |
| 2.464999999999885 | 2.06 | -1.582 | -9.171 |
| 2.469999999999885 | 2.07 | -1.575 | -9.166 |
| 2.474999999999885 | 2.081 | -1.567 | -9.161 |
| 2.479999999999885 | 2.092 | -1.56 | -9.156 |
| 2.484999999999885 | 2.102 | -1.552 | -9.151 |
| 2.489999999999885 | 2.113 | -1.545 | -9.146 |
| 2.494999999999885 | 2.124 | -1.537 | -9.141 |
| 2.499999999999884 | 2.134 | -1.53 | -9.136 |
| 2.504999999999884 | 2.145 | -1.522 | -9.13 |
| 2.509999999999884 | 2.156 | -1.514 | -9.125 |
| 2.514999999999884 | 2.167 | -1.507 | -9.12 |
| 2.519999999999884 | 2.178 | -1.499 | -9.115 |
| 2.524999999999884 | 2.189 | -1.491 | -9.11 |
| 2.529999999999884 | 2.2 | -1.483 | -9.104 |
| 2.534999999999884 | 2.211 | -1.476 | -9.099 |
| 2.539999999999884 | 2.222 | -1.468 | -9.094 |
| 2.544999999999884 | 2.233 | -1.46 | -9.089 |
| 2.549999999999883 | 2.244 | -1.452 | -9.083 |
| 2.554999999999883 | 2.255 | -1.444 | -9.078 |
| 2.559999999999883 | 2.266 | -1.436 | -9.073 |
| 2.564999999999883 | 2.277 | -1.428 | -9.067 |
| 2.569999999999883 | 2.288 | -1.42 | -9.062 |
| 2.574999999999883 | 2.299 | -1.412 | -9.056 |
| 2.579999999999883 | 2.31 | -1.404 | -9.051 |
| 2.584999999999883 | 2.322 | -1.396 | -9.045 |
| 2.589999999999883 | 2.333 | -1.388 | -9.04 |
| 2.594999999999882 | 2.344 | -1.38 | -9.034 |
| 2.599999999999882 | 2.356 | -1.372 | -9.029 |
| 2.604999999999882 | 2.367 | -1.363 | -9.023 |
| 2.609999999999882 | 2.378 | -1.355 | -9.017 |
| 2.614999999999882 | 2.39 | -1.347 | -9.012 |
| 2.619999999999882 | 2.401 | -1.339 | -9.006 |
| 2.624999999999882 | 2.412 | -1.33 | -9 |
| 2.629999999999882 | 2.424 | -1.322 | -8.995 |
| 2.634999999999882 | 2.435 | -1.314 | -8.989 |
| 2.639999999999881 | 2.447 | -1.305 | -8.983 |
| 2.644999999999881 | 2.459 | -1.297 | -8.978 |
| 2.649999999999881 | 2.47 | -1.289 | -8.972 |
| 2.654999999999881 | 2.482 | -1.28 | -8.966 |
| 2.659999999999881 | 2.493 | -1.272 | -8.96 |
| 2.664999999999881 | 2.505 | -1.263 | -8.954 |
| 2.669999999999881 | 2.517 | -1.255 | -8.948 |
| 2.674999999999881 | 2.528 | -1.246 | -8.942 |
| 2.679999999999881 | 2.54 | -1.237 | -8.936 |
| 2.68499999999988 | 2.552 | -1.229 | -8.93 |
| 2.68999999999988 | 2.564 | -1.22 | -8.925 |
| 2.69499999999988 | 2.576 | -1.212 | -8.919 |
| 2.69999999999988 | 2.587 | -1.203 | -8.912 |
| 2.70499999999988 | 2.599 | -1.194 | -8.906 |
| 2.70999999999988 | 2.611 | -1.185 | -8.9 |
| 2.71499999999988 | 2.623 | -1.177 | -8.894 |
| 2.71999999999988 | 2.635 | -1.168 | -8.888 |
| 2.72499999999988 | 2.647 | -1.159 | -8.882 |
| 2.72999999999988 | 2.659 | -1.15 | -8.876 |
| 2.734999999999879 | 2.671 | -1.141 | -8.87 |
| 2.739999999999879 | 2.683 | -1.132 | -8.863 |
| 2.744999999999879 | 2.695 | -1.123 | -8.857 |
| 2.749999999999879 | 2.708 | -1.114 | -8.851 |
| 2.754999999999879 | 2.72 | -1.105 | -8.845 |
| 2.759999999999879 | 2.732 | -1.096 | -8.838 |
| 2.764999999999879 | 2.744 | -1.087 | -8.832 |
| 2.769999999999879 | 2.756 | -1.078 | -8.826 |
| 2.774999999999879 | 2.769 | -1.069 | -8.819 |
| 2.779999999999878 | 2.781 | -1.06 | -8.813 |
| 2.784999999999878 | 2.793 | -1.051 | -8.806 |
| 2.789999999999878 | 2.806 | -1.041 | -8.8 |
| 2.794999999999878 | 2.818 | -1.032 | -8.793 |
| 2.799999999999878 | 2.83 | -1.023 | -8.787 |
| 2.804999999999878 | 2.843 | -1.014 | -8.78 |
| 2.809999999999878 | 2.855 | -1.004 | -8.774 |
| 2.814999999999878 | 2.868 | -0.995 | -8.767 |
| 2.819999999999878 | 2.88 | -0.986 | -8.761 |
| 2.824999999999878 | 2.893 | -0.976 | -8.754 |
| 2.829999999999877 | 2.905 | -0.967 | -8.747 |
| 2.834999999999877 | 2.918 | -0.957 | -8.741 |
| 2.839999999999877 | 2.931 | -0.948 | -8.734 |
| 2.844999999999877 | 2.943 | -0.938 | -8.727 |
| 2.849999999999877 | 2.956 | -0.929 | -8.721 |
| 2.854999999999877 | 2.969 | -0.919 | -8.714 |
| 2.859999999999877 | 2.981 | -0.91 | -8.707 |
| 2.864999999999877 | 2.994 | -0.9 | -8.7 |
| 2.869999999999877 | 3.007 | -0.89 | -8.693 |
| 2.874999999999876 | 3.02 | -0.881 | -8.686 |
| 2.879999999999876 | 3.032 | -0.871 | -8.68 |
| 2.884999999999876 | 3.045 | -0.861 | -8.673 |
| 2.889999999999876 | 3.058 | -0.852 | -8.666 |
| 2.894999999999876 | 3.071 | -0.842 | -8.659 |
| 2.899999999999876 | 3.084 | -0.832 | -8.652 |
| 2.904999999999876 | 3.097 | -0.822 | -8.645 |
| 2.909999999999876 | 3.11 | -0.812 | -8.638 |
| 2.914999999999876 | 3.123 | -0.802 | -8.631 |
| 2.919999999999876 | 3.136 | -0.792 | -8.623 |
| 2.924999999999875 | 3.149 | -0.783 | -8.616 |
| 2.929999999999875 | 3.162 | -0.773 | -8.609 |
| 2.934999999999875 | 3.175 | -0.763 | -8.602 |
| 2.939999999999875 | 3.189 | -0.753 | -8.595 |
| 2.944999999999875 | 3.202 | -0.742 | -8.588 |
| 2.949999999999875 | 3.215 | -0.732 | -8.58 |
| 2.954999999999875 | 3.228 | -0.722 | -8.573 |
| 2.959999999999875 | 3.242 | -0.712 | -8.566 |
| 2.964999999999875 | 3.255 | -0.702 | -8.559 |
| 2.969999999999874 | 3.268 | -0.692 | -8.551 |
| 2.974999999999874 | 3.282 | -0.681 | -8.544 |
| 2.979999999999874 | 3.295 | -0.671 | -8.536 |
| 2.984999999999874 | 3.308 | -0.661 | -8.529 |
| 2.989999999999874 | 3.322 | -0.651 | -8.522 |
| 2.994999999999874 | 3.335 | -0.64 | -8.514 |
| 2.999999999999874 | 3.349 | -0.63 | -8.507 |
| 3.004999999999874 | 3.362 | -0.62 | -8.499 |
| 3.009999999999874 | 3.376 | -0.609 | -8.492 |
| 3.014999999999874 | 3.389 | -0.599 | -8.484 |
| 3.019999999999873 | 3.403 | -0.588 | -8.476 |
| 3.024999999999873 | 3.417 | -0.578 | -8.469 |
| 3.029999999999873 | 3.43 | -0.567 | -8.461 |
| 3.034999999999873 | 3.444 | -0.557 | -8.454 |
| 3.039999999999873 | 3.458 | -0.546 | -8.446 |
| 3.044999999999873 | 3.471 | -0.535 | -8.438 |
| 3.049999999999873 | 3.485 | -0.525 | -8.43 |
| 3.054999999999873 | 3.499 | -0.514 | -8.423 |
| 3.059999999999873 | 3.513 | -0.503 | -8.415 |
| 3.064999999999872 | 3.526 | -0.493 | -8.407 |
| 3.069999999999872 | 3.54 | -0.482 | -8.399 |
| 3.074999999999872 | 3.554 | -0.471 | -8.391 |
| 3.079999999999872 | 3.568 | -0.46 | -8.383 |
| 3.084999999999872 | 3.582 | -0.449 | -8.376 |
| 3.089999999999872 | 3.596 | -0.438 | -8.368 |
| 3.094999999999872 | 3.61 | -0.428 | -8.36 |
| 3.099999999999872 | 3.624 | -0.417 | -8.352 |
| 3.104999999999872 | 3.638 | -0.406 | -8.344 |
| 3.109999999999872 | 3.652 | -0.395 | -8.336 |
| 3.114999999999871 | 3.666 | -0.384 | -8.328 |
| 3.119999999999871 | 3.68 | -0.373 | -8.319 |
| 3.124999999999871 | 3.695 | -0.362 | -8.311 |
| 3.129999999999871 | 3.709 | -0.35 | -8.303 |
| 3.134999999999871 | 3.723 | -0.339 | -8.295 |
| 3.139999999999871 | 3.737 | -0.328 | -8.287 |
| 3.144999999999871 | 3.752 | -0.317 | -8.279 |
| 3.149999999999871 | 3.766 | -0.306 | -8.27 |
| 3.154999999999871 | 3.78 | -0.295 | -8.262 |
| 3.15999999999987 | 3.795 | -0.283 | -8.254 |
| 3.16499999999987 | 3.809 | -0.272 | -8.245 |
| 3.16999999999987 | 3.823 | -0.261 | -8.237 |
| 3.17499999999987 | 3.838 | -0.249 | -8.229 |
| 3.17999999999987 | 3.852 | -0.238 | -8.22 |
| 3.18499999999987 | 3.867 | -0.227 | -8.212 |
| 3.18999999999987 | 3.881 | -0.215 | -8.203 |
| 3.19499999999987 | 3.896 | -0.204 | -8.195 |
| 3.19999999999987 | 3.91 | -0.192 | -8.186 |
| 3.204999999999869 | 3.925 | -0.181 | -8.178 |
| 3.209999999999869 | 3.939 | -0.169 | -8.169 |
| 3.214999999999869 | 3.954 | -0.157 | -8.161 |
| 3.219999999999869 | 3.969 | -0.146 | -8.152 |
| 3.224999999999869 | 3.983 | -0.134 | -8.144 |
| 3.229999999999869 | 3.998 | -0.123 | -8.135 |
| 3.234999999999869 | 4.013 | -0.111 | -8.126 |
| 3.239999999999869 | 4.028 | -0.099 | -8.118 |
| 3.244999999999869 | 4.043 | -0.087 | -8.109 |
| 3.249999999999869 | 4.057 | -0.076 | -8.1 |
| 3.254999999999868 | 4.072 | -0.064 | -8.091 |
| 3.259999999999868 | 4.087 | -0.052 | -8.082 |
| 3.264999999999868 | 4.102 | -0.04 | -8.074 |
| 3.269999999999868 | 4.117 | -0.028 | -8.065 |
| 3.274999999999868 | 4.132 | -0.016 | -8.056 |
| 3.279999999999868 | 4.147 | -0.004 | -8.047 |
| 3.284999999999868 | 4.162 | 0.008 | -8.038 |
| 3.289999999999868 | 4.177 | 0.02 | -8.029 |
| 3.294999999999868 | 4.192 | 0.032 | -8.02 |
| 3.299999999999867 | 4.207 | 0.044 | -8.011 |
| 3.304999999999867 | 4.222 | 0.056 | -8.002 |
| 3.309999999999867 | 4.237 | 0.068 | -7.993 |
| 3.314999999999867 | 4.253 | 0.08 | -7.984 |
| 3.319999999999867 | 4.268 | 0.092 | -7.975 |
| 3.324999999999867 | 4.283 | 0.104 | -7.965 |
| 3.329999999999867 | 4.298 | 0.117 | -7.956 |
| 3.334999999999867 | 4.314 | 0.129 | -7.947 |
| 3.339999999999867 | 4.329 | 0.141 | -7.938 |
| 3.344999999999866 | 4.344 | 0.153 | -7.929 |
| 3.349999999999866 | 4.36 | 0.166 | -7.919 |
| 3.354999999999866 | 4.375 | 0.178 | -7.91 |
| 3.359999999999866 | 4.39 | 0.19 | -7.901 |
| 3.364999999999866 | 4.406 | 0.203 | -7.891 |
| 3.369999999999866 | 4.421 | 0.215 | -7.882 |
| 3.374999999999866 | 4.437 | 0.228 | -7.873 |
| 3.379999999999866 | 4.452 | 0.24 | -7.863 |
| 3.384999999999866 | 4.468 | 0.253 | -7.854 |
| 3.389999999999866 | 4.484 | 0.265 | -7.844 |
| 3.394999999999865 | 4.499 | 0.278 | -7.835 |
| 3.399999999999865 | 4.515 | 0.291 | -7.825 |
| 3.404999999999865 | 4.53 | 0.303 | -7.815 |
| 3.409999999999865 | 4.546 | 0.316 | -7.806 |
| 3.414999999999865 | 4.562 | 0.329 | -7.796 |
| 3.419999999999865 | 4.578 | 0.341 | -7.787 |
| 3.424999999999865 | 4.593 | 0.354 | -7.777 |
| 3.429999999999865 | 4.609 | 0.367 | -7.767 |
| 3.434999999999865 | 4.625 | 0.38 | -7.758 |
| 3.439999999999864 | 4.641 | 0.393 | -7.748 |
| 3.444999999999864 | 4.657 | 0.405 | -7.738 |
| 3.449999999999864 | 4.673 | 0.418 | -7.728 |
| 3.454999999999864 | 4.688 | 0.431 | -7.718 |
| 3.459999999999864 | 4.704 | 0.444 | -7.708 |
| 3.464999999999864 | 4.72 | 0.457 | -7.699 |
| 3.469999999999864 | 4.736 | 0.47 | -7.689 |
| 3.474999999999864 | 4.752 | 0.483 | -7.679 |
| 3.479999999999864 | 4.768 | 0.496 | -7.669 |
| 3.484999999999864 | 4.785 | 0.509 | -7.659 |
| 3.489999999999863 | 4.801 | 0.522 | -7.649 |
| 3.494999999999863 | 4.817 | 0.536 | -7.639 |
| 3.499999999999863 | 4.833 | 0.549 | -7.629 |
| 3.504999999999863 | 4.849 | 0.562 | -7.619 |
| 3.509999999999863 | 4.865 | 0.575 | -7.608 |
| 3.514999999999863 | 4.882 | 0.589 | -7.598 |
| 3.519999999999863 | 4.898 | 0.602 | -7.588 |
| 3.524999999999863 | 4.914 | 0.615 | -7.578 |
| 3.529999999999863 | 4.931 | 0.628 | -7.568 |
| 3.534999999999862 | 4.947 | 0.642 | -7.557 |
| 3.539999999999862 | 4.963 | 0.655 | -7.547 |
| 3.544999999999862 | 4.98 | 0.669 | -7.537 |
| 3.549999999999862 | 4.996 | 0.682 | -7.526 |
| 3.554999999999862 | 5.013 | 0.696 | -7.516 |
| 3.559999999999862 | 5.029 | 0.709 | -7.506 |
| 3.564999999999862 | 5.046 | 0.723 | -7.495 |
| 3.569999999999862 | 5.062 | 0.736 | -7.485 |
| 3.574999999999862 | 5.079 | 0.75 | -7.474 |
| 3.579999999999862 | 5.095 | 0.763 | -7.464 |
| 3.584999999999861 | 5.112 | 0.777 | -7.453 |
| 3.589999999999861 | 5.129 | 0.791 | -7.443 |
| 3.594999999999861 | 5.145 | 0.805 | -7.432 |
| 3.599999999999861 | 5.162 | 0.818 | -7.422 |
| 3.604999999999861 | 5.179 | 0.832 | -7.411 |
| 3.609999999999861 | 5.195 | 0.846 | -7.4 |
| 3.614999999999861 | 5.212 | 0.86 | -7.39 |
| 3.619999999999861 | 5.229 | 0.874 | -7.379 |
| 3.62499999999986 | 5.246 | 0.887 | -7.368 |
| 3.62999999999986 | 5.263 | 0.901 | -7.357 |
| 3.63499999999986 | 5.28 | 0.915 | -7.346 |
| 3.63999999999986 | 5.296 | 0.929 | -7.336 |
| 3.64499999999986 | 5.313 | 0.943 | -7.325 |
| 3.64999999999986 | 5.33 | 0.957 | -7.314 |
| 3.65499999999986 | 5.347 | 0.971 | -7.303 |
| 3.65999999999986 | 5.364 | 0.985 | -7.292 |
| 3.66499999999986 | 5.381 | 0.999 | -7.281 |
| 3.669999999999859 | 5.398 | 1.014 | -7.27 |
| 3.674999999999859 | 5.416 | 1.028 | -7.259 |
| 3.679999999999859 | 5.433 | 1.042 | -7.248 |
| 3.684999999999859 | 5.45 | 1.056 | -7.237 |
| 3.689999999999859 | 5.467 | 1.07 | -7.226 |
| 3.694999999999859 | 5.484 | 1.085 | -7.215 |
| 3.699999999999859 | 5.501 | 1.099 | -7.204 |
| 3.704999999999859 | 5.519 | 1.113 | -7.192 |
| 3.709999999999859 | 5.536 | 1.128 | -7.181 |
| 3.714999999999859 | 5.553 | 1.142 | -7.17 |
| 3.719999999999858 | 5.571 | 1.156 | -7.159 |
| 3.724999999999858 | 5.588 | 1.171 | -7.148 |
| 3.729999999999858 | 5.605 | 1.185 | -7.136 |
| 3.734999999999858 | 5.623 | 1.2 | -7.125 |
| 3.739999999999858 | 5.64 | 1.214 | -7.113 |
| 3.744999999999858 | 5.658 | 1.229 | -7.102 |
| 3.749999999999858 | 5.675 | 1.244 | -7.091 |
| 3.754999999999858 | 5.693 | 1.258 | -7.079 |
| 3.759999999999858 | 5.71 | 1.273 | -7.068 |
| 3.764999999999857 | 5.728 | 1.287 | -7.056 |
| 3.769999999999857 | 5.745 | 1.302 | -7.045 |
| 3.774999999999857 | 5.763 | 1.317 | -7.033 |
| 3.779999999999857 | 5.781 | 1.332 | -7.022 |
| 3.784999999999857 | 5.798 | 1.346 | -7.01 |
| 3.789999999999857 | 5.816 | 1.361 | -6.998 |
| 3.794999999999857 | 5.834 | 1.376 | -6.987 |
| 3.799999999999857 | 5.852 | 1.391 | -6.975 |
| 3.804999999999857 | 5.869 | 1.406 | -6.963 |
| 3.809999999999857 | 5.887 | 1.421 | -6.952 |
| 3.814999999999856 | 5.905 | 1.436 | -6.94 |
| 3.819999999999856 | 5.923 | 1.451 | -6.928 |
| 3.824999999999856 | 5.941 | 1.466 | -6.916 |
| 3.829999999999856 | 5.959 | 1.481 | -6.904 |
| 3.834999999999856 | 5.977 | 1.496 | -6.892 |
| 3.839999999999856 | 5.995 | 1.511 | -6.88 |
| 3.844999999999856 | 6.013 | 1.526 | -6.869 |
| 3.849999999999856 | 6.031 | 1.541 | -6.857 |
| 3.854999999999856 | 6.049 | 1.556 | -6.845 |
| 3.859999999999855 | 6.067 | 1.572 | -6.833 |
| 3.864999999999855 | 6.085 | 1.587 | -6.821 |
| 3.869999999999855 | 6.103 | 1.602 | -6.808 |
| 3.874999999999855 | 6.121 | 1.617 | -6.796 |
| 3.879999999999855 | 6.139 | 1.633 | -6.784 |
| 3.884999999999855 | 6.157 | 1.648 | -6.772 |
| 3.889999999999855 | 6.176 | 1.663 | -6.76 |
| 3.894999999999855 | 6.194 | 1.679 | -6.748 |
| 3.899999999999855 | 6.212 | 1.694 | -6.735 |
| 3.904999999999855 | 6.23 | 1.71 | -6.723 |
| 3.909999999999854 | 6.249 | 1.725 | -6.711 |
| 3.914999999999854 | 6.267 | 1.741 | -6.699 |
| 3.919999999999854 | 6.286 | 1.756 | -6.686 |
| 3.924999999999854 | 6.304 | 1.772 | -6.674 |
| 3.929999999999854 | 6.322 | 1.787 | -6.661 |
| 3.934999999999854 | 6.341 | 1.803 | -6.649 |
| 3.939999999999854 | 6.359 | 1.819 | -6.637 |
| 3.944999999999854 | 6.378 | 1.834 | -6.624 |
| 3.949999999999854 | 6.396 | 1.85 | -6.612 |
| 3.954999999999853 | 6.415 | 1.866 | -6.599 |
| 3.959999999999853 | 6.434 | 1.881 | -6.586 |
| 3.964999999999853 | 6.452 | 1.897 | -6.574 |
| 3.969999999999853 | 6.471 | 1.913 | -6.561 |
| 3.974999999999853 | 6.49 | 1.929 | -6.549 |
| 3.979999999999853 | 6.508 | 1.945 | -6.536 |
| 3.984999999999853 | 6.527 | 1.961 | -6.523 |
| 3.989999999999853 | 6.546 | 1.977 | -6.51 |
| 3.994999999999853 | 6.565 | 1.993 | -6.498 |
| 3.999999999999853 | 6.583 | 2.009 | -6.485 |
| 4.004999999999852 | 6.602 | 2.025 | -6.472 |
| 4.009999999999852 | 6.621 | 2.041 | -6.459 |
| 4.014999999999852 | 6.64 | 2.057 | -6.446 |
| 4.019999999999852 | 6.659 | 2.073 | -6.434 |
| 4.024999999999852 | 6.678 | 2.089 | -6.421 |
| 4.029999999999852 | 6.697 | 2.105 | -6.408 |
| 4.034999999999852 | 6.716 | 2.121 | -6.395 |
| 4.039999999999851 | 6.735 | 2.137 | -6.382 |
| 4.044999999999852 | 6.754 | 2.154 | -6.369 |
| 4.049999999999851 | 6.773 | 2.17 | -6.356 |
| 4.054999999999851 | 6.792 | 2.186 | -6.342 |
| 4.059999999999851 | 6.811 | 2.203 | -6.329 |
| 4.064999999999851 | 6.83 | 2.219 | -6.316 |
| 4.069999999999851 | 6.849 | 2.235 | -6.303 |
| 4.074999999999851 | 6.869 | 2.252 | -6.29 |
| 4.07999999999985 | 6.888 | 2.268 | -6.277 |
| 4.084999999999851 | 6.907 | 2.285 | -6.263 |
| 4.08999999999985 | 6.926 | 2.301 | -6.25 |
| 4.094999999999851 | 6.946 | 2.318 | -6.237 |
| 4.09999999999985 | 6.965 | 2.334 | -6.223 |
| 4.10499999999985 | 6.984 | 2.351 | -6.21 |
| 4.10999999999985 | 7.004 | 2.367 | -6.197 |
| 4.11499999999985 | 7.023 | 2.384 | -6.183 |
| 4.11999999999985 | 7.043 | 2.401 | -6.17 |
| 4.12499999999985 | 7.062 | 2.417 | -6.156 |
| 4.12999999999985 | 7.082 | 2.434 | -6.143 |
| 4.13499999999985 | 7.101 | 2.451 | -6.129 |
| 4.13999999999985 | 7.121 | 2.468 | -6.116 |
| 4.144999999999849 | 7.14 | 2.484 | -6.102 |
| 4.14999999999985 | 7.16 | 2.501 | -6.089 |
| 4.154999999999849 | 7.18 | 2.518 | -6.075 |
| 4.15999999999985 | 7.199 | 2.535 | -6.061 |
| 4.164999999999849 | 7.219 | 2.552 | -6.048 |
| 4.169999999999849 | 7.239 | 2.569 | -6.034 |
| 4.174999999999849 | 7.258 | 2.586 | -6.02 |
| 4.179999999999848 | 7.278 | 2.603 | -6.006 |
| 4.184999999999849 | 7.298 | 2.62 | -5.992 |
| 4.189999999999848 | 7.318 | 2.637 | -5.979 |
| 4.194999999999848 | 7.337 | 2.654 | -5.965 |
| 4.199999999999848 | 7.357 | 2.671 | -5.951 |
| 4.204999999999848 | 7.377 | 2.688 | -5.937 |
| 4.209999999999848 | 7.397 | 2.705 | -5.923 |
| 4.214999999999848 | 7.417 | 2.722 | -5.909 |
| 4.219999999999847 | 7.437 | 2.74 | -5.895 |
| 4.224999999999848 | 7.457 | 2.757 | -5.881 |
| 4.229999999999847 | 7.477 | 2.774 | -5.867 |
| 4.234999999999847 | 7.497 | 2.791 | -5.853 |
| 4.239999999999847 | 7.517 | 2.809 | -5.839 |
| 4.244999999999847 | 7.537 | 2.826 | -5.825 |
| 4.249999999999847 | 7.557 | 2.843 | -5.81 |
| 4.254999999999847 | 7.578 | 2.861 | -5.796 |
| 4.259999999999846 | 7.598 | 2.878 | -5.782 |
| 4.264999999999847 | 7.618 | 2.896 | -5.768 |
| 4.269999999999846 | 7.638 | 2.913 | -5.753 |
| 4.274999999999846 | 7.658 | 2.931 | -5.739 |
| 4.279999999999846 | 7.679 | 2.948 | -5.725 |
| 4.284999999999846 | 7.699 | 2.966 | -5.71 |
| 4.289999999999846 | 7.719 | 2.984 | -5.696 |
| 4.294999999999846 | 7.74 | 3.001 | -5.682 |
| 4.299999999999846 | 7.76 | 3.019 | -5.667 |
| 4.304999999999846 | 7.78 | 3.037 | -5.653 |
| 4.309999999999845 | 7.801 | 3.054 | -5.638 |
| 4.314999999999846 | 7.821 | 3.072 | -5.624 |
| 4.319999999999845 | 7.842 | 3.09 | -5.609 |
| 4.324999999999846 | 7.862 | 3.108 | -5.595 |
| 4.329999999999845 | 7.883 | 3.125 | -5.58 |
| 4.334999999999845 | 7.903 | 3.143 | -5.565 |
| 4.339999999999845 | 7.924 | 3.161 | -5.551 |
| 4.344999999999845 | 7.945 | 3.179 | -5.536 |
| 4.349999999999845 | 7.965 | 3.197 | -5.521 |
| 4.354999999999845 | 7.986 | 3.215 | -5.506 |
| 4.359999999999844 | 8.007 | 3.233 | -5.492 |
| 4.364999999999845 | 8.027 | 3.251 | -5.477 |
| 4.369999999999844 | 8.048 | 3.269 | -5.462 |
| 4.374999999999844 | 8.069 | 3.287 | -5.447 |
| 4.379999999999844 | 8.09 | 3.305 | -5.432 |
| 4.384999999999844 | 8.111 | 3.323 | -5.417 |
| 4.389999999999844 | 8.131 | 3.342 | -5.402 |
| 4.394999999999844 | 8.152 | 3.36 | -5.387 |
| 4.399999999999844 | 8.173 | 3.378 | -5.372 |
| 4.404999999999844 | 8.194 | 3.396 | -5.357 |
| 4.409999999999843 | 8.215 | 3.414 | -5.342 |
| 4.414999999999844 | 8.236 | 3.433 | -5.327 |
| 4.419999999999843 | 8.257 | 3.451 | -5.312 |
| 4.424999999999843 | 8.278 | 3.469 | -5.297 |
| 4.429999999999843 | 8.299 | 3.488 | -5.282 |
| 4.434999999999843 | 8.32 | 3.506 | -5.267 |
| 4.439999999999843 | 8.341 | 3.525 | -5.251 |
| 4.444999999999843 | 8.363 | 3.543 | -5.236 |
| 4.449999999999842 | 8.384 | 3.562 | -5.221 |
| 4.454999999999843 | 8.405 | 3.58 | -5.206 |
| 4.459999999999842 | 8.426 | 3.599 | -5.19 |
| 4.464999999999843 | 8.447 | 3.617 | -5.175 |
| 4.469999999999842 | 8.469 | 3.636 | -5.159 |
| 4.474999999999842 | 8.49 | 3.655 | -5.144 |
| 4.479999999999842 | 8.511 | 3.673 | -5.129 |
| 4.484999999999842 | 8.533 | 3.692 | -5.113 |
| 4.489999999999842 | 8.554 | 3.711 | -5.098 |
| 4.494999999999842 | 8.575 | 3.729 | -5.082 |
| 4.499999999999841 | 8.597 | 3.748 | -5.066 |
| 4.504999999999842 | 8.618 | 3.767 | -5.051 |
| 4.509999999999841 | 8.64 | 3.786 | -5.035 |
| 4.514999999999842 | 8.661 | 3.805 | -5.02 |
| 4.519999999999841 | 8.683 | 3.824 | -5.004 |
| 4.524999999999841 | 8.704 | 3.842 | -4.988 |
| 4.529999999999841 | 8.726 | 3.861 | -4.972 |
| 4.534999999999841 | 8.748 | 3.88 | -4.957 |
| 4.53999999999984 | 8.769 | 3.899 | -4.941 |
| 4.544999999999841 | 8.791 | 3.918 | -4.925 |
| 4.54999999999984 | 8.813 | 3.937 | -4.909 |
| 4.554999999999841 | 8.834 | 3.957 | -4.893 |
| 4.55999999999984 | 8.856 | 3.976 | -4.878 |
| 4.564999999999841 | 8.878 | 3.995 | -4.862 |
| 4.56999999999984 | 8.9 | 4.014 | -4.846 |
| 4.57499999999984 | 8.921 | 4.033 | -4.83 |
| 4.57999999999984 | 8.943 | 4.052 | -4.814 |
| 4.58499999999984 | 8.965 | 4.072 | -4.798 |
| 4.58999999999984 | 8.987 | 4.091 | -4.782 |
| 4.59499999999984 | 9.009 | 4.11 | -4.765 |
| 4.59999999999984 | 9.031 | 4.129 | -4.749 |
| 4.60499999999984 | 9.053 | 4.149 | -4.733 |
| 4.60999999999984 | 9.075 | 4.168 | -4.717 |
| 4.614999999999839 | 9.097 | 4.188 | -4.701 |
| 4.61999999999984 | 9.119 | 4.207 | -4.685 |
| 4.624999999999839 | 9.141 | 4.227 | -4.668 |
| 4.62999999999984 | 9.163 | 4.246 | -4.652 |
| 4.634999999999839 | 9.185 | 4.266 | -4.636 |
| 4.639999999999838 | 9.207 | 4.285 | -4.619 |
| 4.644999999999839 | 9.23 | 4.305 | -4.603 |
| 4.649999999999838 | 9.252 | 4.324 | -4.587 |
| 4.654999999999839 | 9.274 | 4.344 | -4.57 |
| 4.659999999999838 | 9.296 | 4.364 | -4.554 |
| 4.664999999999838 | 9.319 | 4.383 | -4.537 |
| 4.669999999999838 | 9.341 | 4.403 | -4.521 |
| 4.674999999999838 | 9.363 | 4.423 | -4.504 |
| 4.679999999999837 | 9.386 | 4.443 | -4.488 |
| 4.684999999999838 | 9.408 | 4.462 | -4.471 |
| 4.689999999999837 | 9.43 | 4.482 | -4.454 |
| 4.694999999999838 | 9.453 | 4.502 | -4.438 |
| 4.699999999999837 | 9.475 | 4.522 | -4.421 |
| 4.704999999999837 | 9.498 | 4.542 | -4.404 |
| 4.709999999999837 | 9.52 | 4.562 | -4.388 |
| 4.714999999999837 | 9.543 | 4.582 | -4.371 |
| 4.719999999999837 | 9.565 | 4.602 | -4.354 |
| 4.724999999999837 | 9.588 | 4.622 | -4.337 |
| 4.729999999999836 | 9.611 | 4.642 | -4.32 |
| 4.734999999999836 | 9.633 | 4.662 | -4.303 |
| 4.739999999999836 | 9.656 | 4.682 | -4.287 |
| 4.744999999999836 | 9.679 | 4.702 | -4.27 |
| 4.749999999999836 | 9.701 | 4.722 | -4.253 |
| 4.754999999999836 | 9.724 | 4.742 | -4.236 |
| 4.759999999999836 | 9.747 | 4.763 | -4.219 |
| 4.764999999999836 | 9.77 | 4.783 | -4.202 |
| 4.769999999999836 | 9.793 | 4.803 | -4.184 |
| 4.774999999999835 | 9.815 | 4.823 | -4.167 |
| 4.779999999999835 | 9.838 | 4.844 | -4.15 |
| 4.784999999999835 | 9.861 | 4.864 | -4.133 |
| 4.789999999999835 | 9.884 | 4.885 | -4.116 |
| 4.794999999999835 | 9.907 | 4.905 | -4.099 |
| 4.799999999999835 | 9.93 | 4.925 | -4.081 |
| 4.804999999999835 | 9.953 | 4.946 | -4.064 |
| 4.809999999999835 | 9.976 | 4.966 | -4.047 |
| 4.814999999999835 | 9.999 | 4.987 | -4.03 |
| 4.819999999999835 | 10.022 | 5.007 | -4.012 |
| 4.824999999999835 | 10.045 | 5.028 | -3.995 |
| 4.829999999999834 | 10.069 | 5.049 | -3.977 |
| 4.834999999999834 | 10.092 | 5.069 | -3.96 |
| 4.839999999999834 | 10.115 | 5.09 | -3.942 |
| 4.844999999999834 | 10.138 | 5.111 | -3.925 |
| 4.849999999999834 | 10.161 | 5.131 | -3.907 |
| 4.854999999999834 | 10.185 | 5.152 | -3.89 |
| 4.859999999999834 | 10.208 | 5.173 | -3.872 |
| 4.864999999999834 | 10.231 | 5.194 | -3.855 |
| 4.869999999999834 | 10.255 | 5.214 | -3.837 |
| 4.874999999999834 | 10.278 | 5.235 | -3.819 |
| 4.879999999999833 | 10.301 | 5.256 | -3.802 |
| 4.884999999999834 | 10.325 | 5.277 | -3.784 |
| 4.889999999999833 | 10.348 | 5.298 | -3.766 |
| 4.894999999999833 | 10.372 | 5.319 | -3.748 |
| 4.899999999999833 | 10.395 | 5.34 | -3.731 |
| 4.904999999999833 | 10.419 | 5.361 | -3.713 |
| 4.909999999999833 | 10.442 | 5.382 | -3.695 |
| 4.914999999999833 | 10.466 | 5.403 | -3.677 |
| 4.919999999999832 | 10.49 | 5.424 | -3.659 |
| 4.924999999999833 | 10.513 | 5.445 | -3.641 |
| 4.929999999999832 | 10.537 | 5.466 | -3.623 |
| 4.934999999999832 | 10.561 | 5.488 | -3.605 |
| 4.939999999999832 | 10.584 | 5.509 | -3.587 |
| 4.944999999999832 | 10.608 | 5.53 | -3.569 |
| 4.949999999999832 | 10.632 | 5.551 | -3.551 |
| 4.954999999999832 | 10.656 | 5.573 | -3.533 |
| 4.959999999999832 | 10.679 | 5.594 | -3.515 |
| 4.964999999999832 | 10.703 | 5.615 | -3.497 |
| 4.969999999999831 | 10.727 | 5.637 | -3.478 |
| 4.974999999999831 | 10.751 | 5.658 | -3.46 |
| 4.97999999999983 | 10.775 | 5.679 | -3.442 |
| 4.984999999999831 | 10.799 | 5.701 | -3.424 |
| 4.98999999999983 | 10.823 | 5.722 | -3.405 |
| 4.994999999999831 | 10.847 | 5.744 | -3.387 |
| 4.99999999999983 | 10.871 | 5.765 | -3.369 |